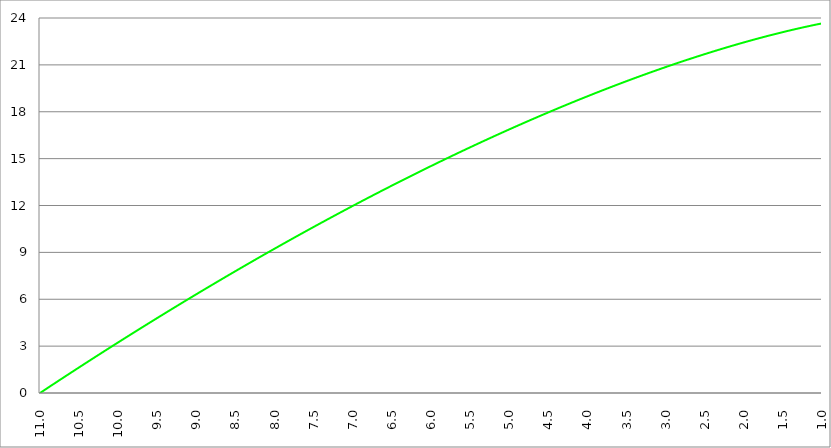
| Category | Series 1 | Series 0 | Series 2 |
|---|---|---|---|
| 11.0 |  | 0 |  |
| 10.995 |  | 0.017 |  |
| 10.99 |  | 0.033 |  |
| 10.985 |  | 0.05 |  |
| 10.98 |  | 0.066 |  |
| 10.975 |  | 0.083 |  |
| 10.97 |  | 0.099 |  |
| 10.96499999999999 |  | 0.116 |  |
| 10.96 |  | 0.133 |  |
| 10.955 |  | 0.149 |  |
| 10.95 |  | 0.166 |  |
| 10.945 |  | 0.182 |  |
| 10.94 |  | 0.199 |  |
| 10.93499999999999 |  | 0.215 |  |
| 10.92999999999999 |  | 0.232 |  |
| 10.92499999999999 |  | 0.248 |  |
| 10.91999999999999 |  | 0.265 |  |
| 10.91499999999999 |  | 0.281 |  |
| 10.90999999999999 |  | 0.298 |  |
| 10.90499999999999 |  | 0.314 |  |
| 10.89999999999998 |  | 0.331 |  |
| 10.89499999999998 |  | 0.347 |  |
| 10.88999999999998 |  | 0.364 |  |
| 10.88499999999998 |  | 0.38 |  |
| 10.87999999999998 |  | 0.397 |  |
| 10.87499999999998 |  | 0.413 |  |
| 10.86999999999998 |  | 0.43 |  |
| 10.86499999999998 |  | 0.446 |  |
| 10.85999999999998 |  | 0.463 |  |
| 10.85499999999998 |  | 0.479 |  |
| 10.84999999999998 |  | 0.496 |  |
| 10.84499999999998 |  | 0.512 |  |
| 10.83999999999997 |  | 0.529 |  |
| 10.83499999999997 |  | 0.545 |  |
| 10.82999999999997 |  | 0.562 |  |
| 10.82499999999997 |  | 0.578 |  |
| 10.81999999999997 |  | 0.595 |  |
| 10.81499999999997 |  | 0.611 |  |
| 10.80999999999997 |  | 0.627 |  |
| 10.80499999999997 |  | 0.644 |  |
| 10.79999999999997 |  | 0.66 |  |
| 10.79499999999997 |  | 0.677 |  |
| 10.78999999999997 |  | 0.693 |  |
| 10.78499999999997 |  | 0.71 |  |
| 10.77999999999997 |  | 0.726 |  |
| 10.77499999999996 |  | 0.742 |  |
| 10.76999999999996 |  | 0.759 |  |
| 10.76499999999996 |  | 0.775 |  |
| 10.75999999999996 |  | 0.792 |  |
| 10.75499999999996 |  | 0.808 |  |
| 10.74999999999996 |  | 0.824 |  |
| 10.74499999999996 |  | 0.841 |  |
| 10.73999999999996 |  | 0.857 |  |
| 10.73499999999996 |  | 0.874 |  |
| 10.72999999999996 |  | 0.89 |  |
| 10.72499999999996 |  | 0.906 |  |
| 10.71999999999996 |  | 0.923 |  |
| 10.71499999999996 |  | 0.939 |  |
| 10.70999999999995 |  | 0.955 |  |
| 10.70499999999995 |  | 0.972 |  |
| 10.69999999999995 |  | 0.988 |  |
| 10.69499999999995 |  | 1.005 |  |
| 10.68999999999995 |  | 1.021 |  |
| 10.68499999999995 |  | 1.037 |  |
| 10.67999999999995 |  | 1.054 |  |
| 10.67499999999995 |  | 1.07 |  |
| 10.66999999999995 |  | 1.086 |  |
| 10.66499999999995 |  | 1.103 |  |
| 10.65999999999995 |  | 1.119 |  |
| 10.65499999999995 |  | 1.135 |  |
| 10.64999999999995 |  | 1.152 |  |
| 10.64499999999994 |  | 1.168 |  |
| 10.63999999999994 |  | 1.184 |  |
| 10.63499999999994 |  | 1.2 |  |
| 10.62999999999994 |  | 1.217 |  |
| 10.62499999999994 |  | 1.233 |  |
| 10.61999999999994 |  | 1.249 |  |
| 10.61499999999994 |  | 1.266 |  |
| 10.60999999999994 |  | 1.282 |  |
| 10.60499999999994 |  | 1.298 |  |
| 10.59999999999994 |  | 1.315 |  |
| 10.59499999999994 |  | 1.331 |  |
| 10.58999999999994 |  | 1.347 |  |
| 10.58499999999994 |  | 1.363 |  |
| 10.57999999999993 |  | 1.38 |  |
| 10.57499999999993 |  | 1.396 |  |
| 10.56999999999993 |  | 1.412 |  |
| 10.56499999999993 |  | 1.428 |  |
| 10.55999999999993 |  | 1.445 |  |
| 10.55499999999993 |  | 1.461 |  |
| 10.54999999999993 |  | 1.477 |  |
| 10.54499999999993 |  | 1.493 |  |
| 10.53999999999993 |  | 1.51 |  |
| 10.53499999999993 |  | 1.526 |  |
| 10.52999999999993 |  | 1.542 |  |
| 10.52499999999993 |  | 1.558 |  |
| 10.51999999999992 |  | 1.574 |  |
| 10.51499999999992 |  | 1.591 |  |
| 10.50999999999992 |  | 1.607 |  |
| 10.50499999999992 |  | 1.623 |  |
| 10.49999999999992 |  | 1.639 |  |
| 10.49499999999992 |  | 1.656 |  |
| 10.48999999999992 |  | 1.672 |  |
| 10.48499999999992 |  | 1.688 |  |
| 10.47999999999992 |  | 1.704 |  |
| 10.47499999999992 |  | 1.72 |  |
| 10.46999999999992 |  | 1.736 |  |
| 10.46499999999992 |  | 1.753 |  |
| 10.45999999999992 |  | 1.769 |  |
| 10.45499999999991 |  | 1.785 |  |
| 10.44999999999991 |  | 1.801 |  |
| 10.44499999999991 |  | 1.817 |  |
| 10.43999999999991 |  | 1.833 |  |
| 10.43499999999991 |  | 1.85 |  |
| 10.42999999999991 |  | 1.866 |  |
| 10.42499999999991 |  | 1.882 |  |
| 10.41999999999991 |  | 1.898 |  |
| 10.41499999999991 |  | 1.914 |  |
| 10.40999999999991 |  | 1.93 |  |
| 10.40499999999991 |  | 1.946 |  |
| 10.39999999999991 |  | 1.963 |  |
| 10.39499999999991 |  | 1.979 |  |
| 10.3899999999999 |  | 1.995 |  |
| 10.3849999999999 |  | 2.011 |  |
| 10.3799999999999 |  | 2.027 |  |
| 10.3749999999999 |  | 2.043 |  |
| 10.3699999999999 |  | 2.059 |  |
| 10.3649999999999 |  | 2.075 |  |
| 10.3599999999999 |  | 2.091 |  |
| 10.3549999999999 |  | 2.108 |  |
| 10.3499999999999 |  | 2.124 |  |
| 10.3449999999999 |  | 2.14 |  |
| 10.3399999999999 |  | 2.156 |  |
| 10.3349999999999 |  | 2.172 |  |
| 10.3299999999999 |  | 2.188 |  |
| 10.32499999999989 |  | 2.204 |  |
| 10.31999999999989 |  | 2.22 |  |
| 10.31499999999989 |  | 2.236 |  |
| 10.3099999999999 |  | 2.252 |  |
| 10.3049999999999 |  | 2.268 |  |
| 10.2999999999999 |  | 2.284 |  |
| 10.29499999999989 |  | 2.3 |  |
| 10.28999999999989 |  | 2.316 |  |
| 10.28499999999989 |  | 2.332 |  |
| 10.27999999999989 |  | 2.348 |  |
| 10.27499999999989 |  | 2.364 |  |
| 10.26999999999989 |  | 2.381 |  |
| 10.26499999999989 |  | 2.397 |  |
| 10.25999999999988 |  | 2.413 |  |
| 10.25499999999988 |  | 2.429 |  |
| 10.24999999999988 |  | 2.445 |  |
| 10.24499999999988 |  | 2.461 |  |
| 10.23999999999988 |  | 2.477 |  |
| 10.23499999999988 |  | 2.493 |  |
| 10.22999999999988 |  | 2.509 |  |
| 10.22499999999988 |  | 2.525 |  |
| 10.21999999999988 |  | 2.541 |  |
| 10.21499999999988 |  | 2.557 |  |
| 10.20999999999988 |  | 2.573 |  |
| 10.20499999999988 |  | 2.588 |  |
| 10.19999999999987 |  | 2.604 |  |
| 10.19499999999987 |  | 2.62 |  |
| 10.18999999999987 |  | 2.636 |  |
| 10.18499999999987 |  | 2.652 |  |
| 10.17999999999987 |  | 2.668 |  |
| 10.17499999999987 |  | 2.684 |  |
| 10.16999999999987 |  | 2.7 |  |
| 10.16499999999987 |  | 2.716 |  |
| 10.15999999999987 |  | 2.732 |  |
| 10.15499999999987 |  | 2.748 |  |
| 10.14999999999987 |  | 2.764 |  |
| 10.14499999999987 |  | 2.78 |  |
| 10.13999999999987 |  | 2.796 |  |
| 10.13499999999986 |  | 2.812 |  |
| 10.12999999999986 |  | 2.828 |  |
| 10.12499999999986 |  | 2.844 |  |
| 10.11999999999986 |  | 2.859 |  |
| 10.11499999999986 |  | 2.875 |  |
| 10.10999999999986 |  | 2.891 |  |
| 10.10499999999986 |  | 2.907 |  |
| 10.09999999999986 |  | 2.923 |  |
| 10.09499999999986 |  | 2.939 |  |
| 10.08999999999986 |  | 2.955 |  |
| 10.08499999999986 |  | 2.971 |  |
| 10.07999999999986 |  | 2.987 |  |
| 10.07499999999986 |  | 3.002 |  |
| 10.06999999999985 |  | 3.018 |  |
| 10.06499999999985 |  | 3.034 |  |
| 10.05999999999985 |  | 3.05 |  |
| 10.05499999999985 |  | 3.066 |  |
| 10.04999999999985 |  | 3.082 |  |
| 10.04499999999985 |  | 3.098 |  |
| 10.03999999999985 |  | 3.113 |  |
| 10.03499999999985 |  | 3.129 |  |
| 10.02999999999985 |  | 3.145 |  |
| 10.02499999999985 |  | 3.161 |  |
| 10.01999999999985 |  | 3.177 |  |
| 10.01499999999985 |  | 3.193 |  |
| 10.00999999999985 |  | 3.208 |  |
| 10.00499999999984 |  | 3.224 |  |
| 9.999999999999844 |  | 3.24 |  |
| 9.994999999999841 |  | 3.256 |  |
| 9.98999999999984 |  | 3.272 |  |
| 9.98499999999984 |  | 3.287 |  |
| 9.97999999999984 |  | 3.303 |  |
| 9.97499999999984 |  | 3.319 |  |
| 9.969999999999837 |  | 3.335 |  |
| 9.964999999999838 |  | 3.351 |  |
| 9.959999999999837 |  | 3.366 |  |
| 9.954999999999837 |  | 3.382 |  |
| 9.949999999999836 |  | 3.398 |  |
| 9.944999999999835 |  | 3.414 |  |
| 9.939999999999834 |  | 3.43 |  |
| 9.934999999999834 |  | 3.445 |  |
| 9.929999999999833 |  | 3.461 |  |
| 9.92499999999983 |  | 3.477 |  |
| 9.91999999999983 |  | 3.493 |  |
| 9.91499999999983 |  | 3.508 |  |
| 9.90999999999983 |  | 3.524 |  |
| 9.904999999999829 |  | 3.54 |  |
| 9.899999999999826 |  | 3.555 |  |
| 9.894999999999827 |  | 3.571 |  |
| 9.889999999999826 |  | 3.587 |  |
| 9.884999999999826 |  | 3.603 |  |
| 9.879999999999823 |  | 3.618 |  |
| 9.874999999999824 |  | 3.634 |  |
| 9.869999999999823 |  | 3.65 |  |
| 9.864999999999823 |  | 3.666 |  |
| 9.85999999999982 |  | 3.681 |  |
| 9.85499999999982 |  | 3.697 |  |
| 9.84999999999982 |  | 3.713 |  |
| 9.84499999999982 |  | 3.728 |  |
| 9.839999999999819 |  | 3.744 |  |
| 9.834999999999818 |  | 3.76 |  |
| 9.829999999999817 |  | 3.775 |  |
| 9.824999999999816 |  | 3.791 |  |
| 9.819999999999816 |  | 3.807 |  |
| 9.814999999999815 |  | 3.822 |  |
| 9.809999999999812 |  | 3.838 |  |
| 9.804999999999813 |  | 3.854 |  |
| 9.799999999999812 |  | 3.869 |  |
| 9.794999999999812 |  | 3.885 |  |
| 9.78999999999981 |  | 3.901 |  |
| 9.78499999999981 |  | 3.916 |  |
| 9.77999999999981 |  | 3.932 |  |
| 9.774999999999809 |  | 3.948 |  |
| 9.769999999999808 |  | 3.963 |  |
| 9.764999999999807 |  | 3.979 |  |
| 9.759999999999806 |  | 3.994 |  |
| 9.754999999999805 |  | 4.01 |  |
| 9.749999999999805 |  | 4.026 |  |
| 9.744999999999804 |  | 4.041 |  |
| 9.739999999999803 |  | 4.057 |  |
| 9.734999999999802 |  | 4.072 |  |
| 9.729999999999801 |  | 4.088 |  |
| 9.7249999999998 |  | 4.104 |  |
| 9.7199999999998 |  | 4.119 |  |
| 9.7149999999998 |  | 4.135 |  |
| 9.709999999999798 |  | 4.15 |  |
| 9.704999999999798 |  | 4.166 |  |
| 9.699999999999797 |  | 4.182 |  |
| 9.694999999999794 |  | 4.197 |  |
| 9.689999999999795 |  | 4.213 |  |
| 9.684999999999794 |  | 4.228 |  |
| 9.679999999999794 |  | 4.244 |  |
| 9.674999999999793 |  | 4.259 |  |
| 9.66999999999979 |  | 4.275 |  |
| 9.66499999999979 |  | 4.291 |  |
| 9.65999999999979 |  | 4.306 |  |
| 9.65499999999979 |  | 4.322 |  |
| 9.649999999999787 |  | 4.337 |  |
| 9.644999999999788 |  | 4.353 |  |
| 9.639999999999787 |  | 4.368 |  |
| 9.634999999999787 |  | 4.384 |  |
| 9.629999999999786 |  | 4.399 |  |
| 9.624999999999785 |  | 4.415 |  |
| 9.619999999999784 |  | 4.43 |  |
| 9.614999999999783 |  | 4.446 |  |
| 9.609999999999783 |  | 4.461 |  |
| 9.60499999999978 |  | 4.477 |  |
| 9.59999999999978 |  | 4.492 |  |
| 9.59499999999978 |  | 4.508 |  |
| 9.58999999999978 |  | 4.523 |  |
| 9.584999999999779 |  | 4.539 |  |
| 9.579999999999778 |  | 4.554 |  |
| 9.574999999999777 |  | 4.57 |  |
| 9.569999999999776 |  | 4.585 |  |
| 9.564999999999776 |  | 4.601 |  |
| 9.559999999999773 |  | 4.616 |  |
| 9.554999999999774 |  | 4.632 |  |
| 9.549999999999773 |  | 4.647 |  |
| 9.544999999999773 |  | 4.662 |  |
| 9.539999999999772 |  | 4.678 |  |
| 9.534999999999771 |  | 4.693 |  |
| 9.52999999999977 |  | 4.709 |  |
| 9.52499999999977 |  | 4.724 |  |
| 9.519999999999769 |  | 4.74 |  |
| 9.514999999999768 |  | 4.755 |  |
| 9.509999999999767 |  | 4.77 |  |
| 9.504999999999766 |  | 4.786 |  |
| 9.499999999999766 |  | 4.801 |  |
| 9.494999999999765 |  | 4.817 |  |
| 9.489999999999762 |  | 4.832 |  |
| 9.484999999999763 |  | 4.847 |  |
| 9.47999999999976 |  | 4.863 |  |
| 9.47499999999976 |  | 4.878 |  |
| 9.46999999999976 |  | 4.894 |  |
| 9.46499999999976 |  | 4.909 |  |
| 9.45999999999976 |  | 4.924 |  |
| 9.454999999999758 |  | 4.94 |  |
| 9.449999999999758 |  | 4.955 |  |
| 9.444999999999757 |  | 4.971 |  |
| 9.439999999999756 |  | 4.986 |  |
| 9.434999999999755 |  | 5.001 |  |
| 9.429999999999755 |  | 5.017 |  |
| 9.424999999999754 |  | 5.032 |  |
| 9.419999999999751 |  | 5.047 |  |
| 9.414999999999752 |  | 5.063 |  |
| 9.40999999999975 |  | 5.078 |  |
| 9.40499999999975 |  | 5.093 |  |
| 9.39999999999975 |  | 5.109 |  |
| 9.39499999999975 |  | 5.124 |  |
| 9.389999999999748 |  | 5.139 |  |
| 9.384999999999748 |  | 5.155 |  |
| 9.379999999999747 |  | 5.17 |  |
| 9.374999999999744 |  | 5.185 |  |
| 9.369999999999745 |  | 5.201 |  |
| 9.364999999999744 |  | 5.216 |  |
| 9.35999999999974 |  | 5.231 |  |
| 9.35499999999974 |  | 5.246 |  |
| 9.34999999999974 |  | 5.262 |  |
| 9.34499999999974 |  | 5.277 |  |
| 9.33999999999974 |  | 5.292 |  |
| 9.33499999999974 |  | 5.308 |  |
| 9.329999999999737 |  | 5.323 |  |
| 9.324999999999738 |  | 5.338 |  |
| 9.319999999999737 |  | 5.353 |  |
| 9.314999999999737 |  | 5.369 |  |
| 9.309999999999736 |  | 5.384 |  |
| 9.304999999999733 |  | 5.399 |  |
| 9.299999999999734 |  | 5.414 |  |
| 9.294999999999733 |  | 5.43 |  |
| 9.289999999999733 |  | 5.445 |  |
| 9.28499999999973 |  | 5.46 |  |
| 9.27999999999973 |  | 5.475 |  |
| 9.27499999999973 |  | 5.491 |  |
| 9.26999999999973 |  | 5.506 |  |
| 9.264999999999729 |  | 5.521 |  |
| 9.259999999999726 |  | 5.536 |  |
| 9.254999999999727 |  | 5.552 |  |
| 9.249999999999726 |  | 5.567 |  |
| 9.244999999999726 |  | 5.582 |  |
| 9.239999999999725 |  | 5.597 |  |
| 9.234999999999724 |  | 5.612 |  |
| 9.229999999999723 |  | 5.628 |  |
| 9.224999999999723 |  | 5.643 |  |
| 9.219999999999722 |  | 5.658 |  |
| 9.214999999999721 |  | 5.673 |  |
| 9.20999999999972 |  | 5.688 |  |
| 9.20499999999972 |  | 5.703 |  |
| 9.199999999999719 |  | 5.719 |  |
| 9.194999999999718 |  | 5.734 |  |
| 9.189999999999717 |  | 5.749 |  |
| 9.184999999999716 |  | 5.764 |  |
| 9.179999999999715 |  | 5.779 |  |
| 9.174999999999715 |  | 5.794 |  |
| 9.169999999999712 |  | 5.81 |  |
| 9.164999999999713 |  | 5.825 |  |
| 9.15999999999971 |  | 5.84 |  |
| 9.15499999999971 |  | 5.855 |  |
| 9.14999999999971 |  | 5.87 |  |
| 9.14499999999971 |  | 5.885 |  |
| 9.13999999999971 |  | 5.9 |  |
| 9.134999999999708 |  | 5.915 |  |
| 9.129999999999708 |  | 5.931 |  |
| 9.124999999999707 |  | 5.946 |  |
| 9.119999999999706 |  | 5.961 |  |
| 9.114999999999705 |  | 5.976 |  |
| 9.109999999999705 |  | 5.991 |  |
| 9.104999999999704 |  | 6.006 |  |
| 9.099999999999701 |  | 6.021 |  |
| 9.094999999999702 |  | 6.036 |  |
| 9.0899999999997 |  | 6.051 |  |
| 9.0849999999997 |  | 6.066 |  |
| 9.0799999999997 |  | 6.081 |  |
| 9.0749999999997 |  | 6.096 |  |
| 9.069999999999698 |  | 6.112 |  |
| 9.064999999999698 |  | 6.127 |  |
| 9.059999999999697 |  | 6.142 |  |
| 9.054999999999694 |  | 6.157 |  |
| 9.049999999999695 |  | 6.172 |  |
| 9.044999999999694 |  | 6.187 |  |
| 9.039999999999694 |  | 6.202 |  |
| 9.034999999999693 |  | 6.217 |  |
| 9.02999999999969 |  | 6.232 |  |
| 9.02499999999969 |  | 6.247 |  |
| 9.01999999999969 |  | 6.262 |  |
| 9.01499999999969 |  | 6.277 |  |
| 9.009999999999687 |  | 6.292 |  |
| 9.004999999999688 |  | 6.307 |  |
| 8.999999999999687 |  | 6.322 |  |
| 8.994999999999687 |  | 6.337 |  |
| 8.989999999999686 |  | 6.352 |  |
| 8.984999999999683 |  | 6.367 |  |
| 8.979999999999684 |  | 6.382 |  |
| 8.974999999999683 |  | 6.397 |  |
| 8.96999999999968 |  | 6.412 |  |
| 8.96499999999968 |  | 6.427 |  |
| 8.95999999999968 |  | 6.442 |  |
| 8.95499999999968 |  | 6.457 |  |
| 8.94999999999968 |  | 6.472 |  |
| 8.944999999999679 |  | 6.487 |  |
| 8.939999999999676 |  | 6.502 |  |
| 8.934999999999677 |  | 6.517 |  |
| 8.929999999999676 |  | 6.532 |  |
| 8.924999999999676 |  | 6.546 |  |
| 8.919999999999675 |  | 6.561 |  |
| 8.914999999999674 |  | 6.576 |  |
| 8.909999999999673 |  | 6.591 |  |
| 8.904999999999673 |  | 6.606 |  |
| 8.89999999999967 |  | 6.621 |  |
| 8.89499999999967 |  | 6.636 |  |
| 8.88999999999967 |  | 6.651 |  |
| 8.88499999999967 |  | 6.666 |  |
| 8.879999999999669 |  | 6.681 |  |
| 8.874999999999668 |  | 6.696 |  |
| 8.869999999999665 |  | 6.711 |  |
| 8.864999999999666 |  | 6.725 |  |
| 8.859999999999665 |  | 6.74 |  |
| 8.854999999999665 |  | 6.755 |  |
| 8.849999999999662 |  | 6.77 |  |
| 8.844999999999663 |  | 6.785 |  |
| 8.83999999999966 |  | 6.8 |  |
| 8.83499999999966 |  | 6.815 |  |
| 8.82999999999966 |  | 6.829 |  |
| 8.82499999999966 |  | 6.844 |  |
| 8.81999999999966 |  | 6.859 |  |
| 8.814999999999658 |  | 6.874 |  |
| 8.809999999999658 |  | 6.889 |  |
| 8.804999999999657 |  | 6.904 |  |
| 8.799999999999656 |  | 6.919 |  |
| 8.794999999999655 |  | 6.933 |  |
| 8.789999999999655 |  | 6.948 |  |
| 8.784999999999654 |  | 6.963 |  |
| 8.779999999999651 |  | 6.978 |  |
| 8.774999999999652 |  | 6.993 |  |
| 8.76999999999965 |  | 7.007 |  |
| 8.76499999999965 |  | 7.022 |  |
| 8.75999999999965 |  | 7.037 |  |
| 8.754999999999647 |  | 7.052 |  |
| 8.749999999999648 |  | 7.067 |  |
| 8.744999999999647 |  | 7.081 |  |
| 8.739999999999647 |  | 7.096 |  |
| 8.734999999999644 |  | 7.111 |  |
| 8.729999999999645 |  | 7.126 |  |
| 8.724999999999644 |  | 7.141 |  |
| 8.719999999999644 |  | 7.155 |  |
| 8.714999999999643 |  | 7.17 |  |
| 8.70999999999964 |  | 7.185 |  |
| 8.70499999999964 |  | 7.2 |  |
| 8.69999999999964 |  | 7.214 |  |
| 8.69499999999964 |  | 7.229 |  |
| 8.689999999999637 |  | 7.244 |  |
| 8.684999999999638 |  | 7.259 |  |
| 8.679999999999637 |  | 7.273 |  |
| 8.674999999999637 |  | 7.288 |  |
| 8.669999999999636 |  | 7.303 |  |
| 8.664999999999633 |  | 7.318 |  |
| 8.659999999999634 |  | 7.332 |  |
| 8.654999999999633 |  | 7.347 |  |
| 8.649999999999633 |  | 7.362 |  |
| 8.644999999999632 |  | 7.376 |  |
| 8.63999999999963 |  | 7.391 |  |
| 8.63499999999963 |  | 7.406 |  |
| 8.62999999999963 |  | 7.42 |  |
| 8.624999999999629 |  | 7.435 |  |
| 8.619999999999626 |  | 7.45 |  |
| 8.614999999999627 |  | 7.464 |  |
| 8.609999999999626 |  | 7.479 |  |
| 8.604999999999626 |  | 7.494 |  |
| 8.599999999999625 |  | 7.508 |  |
| 8.594999999999624 |  | 7.523 |  |
| 8.589999999999623 |  | 7.538 |  |
| 8.584999999999622 |  | 7.552 |  |
| 8.57999999999962 |  | 7.567 |  |
| 8.57499999999962 |  | 7.582 |  |
| 8.56999999999962 |  | 7.596 |  |
| 8.56499999999962 |  | 7.611 |  |
| 8.559999999999619 |  | 7.626 |  |
| 8.554999999999618 |  | 7.64 |  |
| 8.549999999999617 |  | 7.655 |  |
| 8.544999999999616 |  | 7.67 |  |
| 8.539999999999615 |  | 7.684 |  |
| 8.534999999999615 |  | 7.699 |  |
| 8.529999999999612 |  | 7.713 |  |
| 8.524999999999613 |  | 7.728 |  |
| 8.51999999999961 |  | 7.743 |  |
| 8.51499999999961 |  | 7.757 |  |
| 8.50999999999961 |  | 7.772 |  |
| 8.50499999999961 |  | 7.786 |  |
| 8.49999999999961 |  | 7.801 |  |
| 8.494999999999608 |  | 7.815 |  |
| 8.489999999999608 |  | 7.83 |  |
| 8.484999999999607 |  | 7.845 |  |
| 8.479999999999606 |  | 7.859 |  |
| 8.474999999999605 |  | 7.874 |  |
| 8.469999999999605 |  | 7.888 |  |
| 8.464999999999604 |  | 7.903 |  |
| 8.4599999999996 |  | 7.917 |  |
| 8.4549999999996 |  | 7.932 |  |
| 8.4499999999996 |  | 7.946 |  |
| 8.4449999999996 |  | 7.961 |  |
| 8.4399999999996 |  | 7.976 |  |
| 8.4349999999996 |  | 7.99 |  |
| 8.429999999999598 |  | 8.005 |  |
| 8.424999999999597 |  | 8.019 |  |
| 8.419999999999597 |  | 8.034 |  |
| 8.414999999999594 |  | 8.048 |  |
| 8.409999999999595 |  | 8.063 |  |
| 8.404999999999594 |  | 8.077 |  |
| 8.399999999999594 |  | 8.092 |  |
| 8.394999999999593 |  | 8.106 |  |
| 8.38999999999959 |  | 8.121 |  |
| 8.38499999999959 |  | 8.135 |  |
| 8.37999999999959 |  | 8.15 |  |
| 8.37499999999959 |  | 8.164 |  |
| 8.369999999999589 |  | 8.178 |  |
| 8.364999999999588 |  | 8.193 |  |
| 8.359999999999587 |  | 8.207 |  |
| 8.354999999999587 |  | 8.222 |  |
| 8.349999999999586 |  | 8.236 |  |
| 8.344999999999585 |  | 8.251 |  |
| 8.339999999999584 |  | 8.265 |  |
| 8.334999999999583 |  | 8.28 |  |
| 8.329999999999583 |  | 8.294 |  |
| 8.324999999999582 |  | 8.308 |  |
| 8.31999999999958 |  | 8.323 |  |
| 8.31499999999958 |  | 8.337 |  |
| 8.30999999999958 |  | 8.352 |  |
| 8.304999999999579 |  | 8.366 |  |
| 8.299999999999578 |  | 8.381 |  |
| 8.294999999999577 |  | 8.395 |  |
| 8.289999999999576 |  | 8.409 |  |
| 8.284999999999576 |  | 8.424 |  |
| 8.279999999999575 |  | 8.438 |  |
| 8.274999999999574 |  | 8.453 |  |
| 8.269999999999573 |  | 8.467 |  |
| 8.264999999999572 |  | 8.481 |  |
| 8.259999999999572 |  | 8.496 |  |
| 8.254999999999571 |  | 8.51 |  |
| 8.24999999999957 |  | 8.524 |  |
| 8.24499999999957 |  | 8.539 |  |
| 8.239999999999569 |  | 8.553 |  |
| 8.234999999999568 |  | 8.567 |  |
| 8.229999999999567 |  | 8.582 |  |
| 8.224999999999566 |  | 8.596 |  |
| 8.219999999999565 |  | 8.61 |  |
| 8.214999999999565 |  | 8.625 |  |
| 8.209999999999564 |  | 8.639 |  |
| 8.204999999999563 |  | 8.653 |  |
| 8.199999999999562 |  | 8.668 |  |
| 8.194999999999562 |  | 8.682 |  |
| 8.18999999999956 |  | 8.696 |  |
| 8.18499999999956 |  | 8.711 |  |
| 8.17999999999956 |  | 8.725 |  |
| 8.174999999999558 |  | 8.739 |  |
| 8.169999999999558 |  | 8.754 |  |
| 8.164999999999557 |  | 8.768 |  |
| 8.159999999999556 |  | 8.782 |  |
| 8.154999999999555 |  | 8.796 |  |
| 8.149999999999554 |  | 8.811 |  |
| 8.144999999999554 |  | 8.825 |  |
| 8.139999999999553 |  | 8.839 |  |
| 8.134999999999552 |  | 8.854 |  |
| 8.129999999999551 |  | 8.868 |  |
| 8.12499999999955 |  | 8.882 |  |
| 8.11999999999955 |  | 8.896 |  |
| 8.11499999999955 |  | 8.911 |  |
| 8.109999999999548 |  | 8.925 |  |
| 8.104999999999547 |  | 8.939 |  |
| 8.099999999999547 |  | 8.953 |  |
| 8.094999999999544 |  | 8.967 |  |
| 8.089999999999545 |  | 8.982 |  |
| 8.084999999999544 |  | 8.996 |  |
| 8.079999999999544 |  | 9.01 |  |
| 8.074999999999543 |  | 9.024 |  |
| 8.06999999999954 |  | 9.039 |  |
| 8.06499999999954 |  | 9.053 |  |
| 8.05999999999954 |  | 9.067 |  |
| 8.05499999999954 |  | 9.081 |  |
| 8.049999999999539 |  | 9.095 |  |
| 8.044999999999538 |  | 9.11 |  |
| 8.039999999999537 |  | 9.124 |  |
| 8.034999999999537 |  | 9.138 |  |
| 8.029999999999536 |  | 9.152 |  |
| 8.024999999999535 |  | 9.166 |  |
| 8.019999999999534 |  | 9.18 |  |
| 8.014999999999533 |  | 9.195 |  |
| 8.009999999999533 |  | 9.209 |  |
| 8.004999999999532 |  | 9.223 |  |
| 7.999999999999531 |  | 9.237 |  |
| 7.994999999999532 |  | 9.251 |  |
| 7.989999999999532 |  | 9.265 |  |
| 7.984999999999532 |  | 9.279 |  |
| 7.979999999999532 |  | 9.294 |  |
| 7.974999999999532 |  | 9.308 |  |
| 7.969999999999532 |  | 9.322 |  |
| 7.964999999999533 |  | 9.336 |  |
| 7.959999999999532 |  | 9.35 |  |
| 7.954999999999533 |  | 9.364 |  |
| 7.949999999999532 |  | 9.378 |  |
| 7.944999999999533 |  | 9.392 |  |
| 7.939999999999533 |  | 9.406 |  |
| 7.934999999999533 |  | 9.42 |  |
| 7.929999999999533 |  | 9.435 |  |
| 7.924999999999534 |  | 9.449 |  |
| 7.919999999999533 |  | 9.463 |  |
| 7.914999999999534 |  | 9.477 |  |
| 7.909999999999533 |  | 9.491 |  |
| 7.904999999999534 |  | 9.505 |  |
| 7.899999999999534 |  | 9.519 |  |
| 7.894999999999534 |  | 9.533 |  |
| 7.889999999999534 |  | 9.547 |  |
| 7.884999999999534 |  | 9.561 |  |
| 7.879999999999534 |  | 9.575 |  |
| 7.874999999999534 |  | 9.589 |  |
| 7.869999999999534 |  | 9.603 |  |
| 7.864999999999535 |  | 9.617 |  |
| 7.859999999999534 |  | 9.631 |  |
| 7.854999999999535 |  | 9.645 |  |
| 7.849999999999535 |  | 9.659 |  |
| 7.844999999999535 |  | 9.673 |  |
| 7.839999999999535 |  | 9.687 |  |
| 7.834999999999535 |  | 9.701 |  |
| 7.829999999999535 |  | 9.715 |  |
| 7.824999999999536 |  | 9.729 |  |
| 7.819999999999535 |  | 9.743 |  |
| 7.814999999999536 |  | 9.757 |  |
| 7.809999999999535 |  | 9.771 |  |
| 7.804999999999536 |  | 9.785 |  |
| 7.799999999999536 |  | 9.799 |  |
| 7.794999999999536 |  | 9.813 |  |
| 7.789999999999536 |  | 9.827 |  |
| 7.784999999999536 |  | 9.841 |  |
| 7.779999999999536 |  | 9.855 |  |
| 7.774999999999536 |  | 9.869 |  |
| 7.769999999999536 |  | 9.883 |  |
| 7.764999999999537 |  | 9.897 |  |
| 7.759999999999536 |  | 9.911 |  |
| 7.754999999999537 |  | 9.925 |  |
| 7.749999999999537 |  | 9.939 |  |
| 7.744999999999537 |  | 9.952 |  |
| 7.739999999999537 |  | 9.966 |  |
| 7.734999999999537 |  | 9.98 |  |
| 7.729999999999537 |  | 9.994 |  |
| 7.724999999999538 |  | 10.008 |  |
| 7.719999999999537 |  | 10.022 |  |
| 7.714999999999538 |  | 10.036 |  |
| 7.709999999999538 |  | 10.05 |  |
| 7.704999999999538 |  | 10.064 |  |
| 7.699999999999538 |  | 10.077 |  |
| 7.694999999999538 |  | 10.091 |  |
| 7.689999999999538 |  | 10.105 |  |
| 7.684999999999539 |  | 10.119 |  |
| 7.679999999999538 |  | 10.133 |  |
| 7.674999999999539 |  | 10.147 |  |
| 7.669999999999539 |  | 10.161 |  |
| 7.664999999999539 |  | 10.175 |  |
| 7.65999999999954 |  | 10.188 |  |
| 7.654999999999539 |  | 10.202 |  |
| 7.64999999999954 |  | 10.216 |  |
| 7.644999999999539 |  | 10.23 |  |
| 7.63999999999954 |  | 10.244 |  |
| 7.63499999999954 |  | 10.257 |  |
| 7.62999999999954 |  | 10.271 |  |
| 7.62499999999954 |  | 10.285 |  |
| 7.61999999999954 |  | 10.299 |  |
| 7.61499999999954 |  | 10.313 |  |
| 7.60999999999954 |  | 10.327 |  |
| 7.60499999999954 |  | 10.34 |  |
| 7.59999999999954 |  | 10.354 |  |
| 7.594999999999541 |  | 10.368 |  |
| 7.58999999999954 |  | 10.382 |  |
| 7.584999999999541 |  | 10.395 |  |
| 7.57999999999954 |  | 10.409 |  |
| 7.574999999999541 |  | 10.423 |  |
| 7.569999999999541 |  | 10.437 |  |
| 7.564999999999541 |  | 10.45 |  |
| 7.559999999999541 |  | 10.464 |  |
| 7.554999999999541 |  | 10.478 |  |
| 7.549999999999541 |  | 10.492 |  |
| 7.544999999999542 |  | 10.505 |  |
| 7.539999999999541 |  | 10.519 |  |
| 7.534999999999542 |  | 10.533 |  |
| 7.529999999999542 |  | 10.547 |  |
| 7.524999999999542 |  | 10.56 |  |
| 7.519999999999542 |  | 10.574 |  |
| 7.514999999999542 |  | 10.588 |  |
| 7.509999999999542 |  | 10.601 |  |
| 7.504999999999542 |  | 10.615 |  |
| 7.499999999999542 |  | 10.629 |  |
| 7.494999999999543 |  | 10.643 |  |
| 7.489999999999542 |  | 10.656 |  |
| 7.484999999999543 |  | 10.67 |  |
| 7.479999999999542 |  | 10.684 |  |
| 7.474999999999543 |  | 10.697 |  |
| 7.469999999999543 |  | 10.711 |  |
| 7.464999999999543 |  | 10.725 |  |
| 7.459999999999543 |  | 10.738 |  |
| 7.454999999999544 |  | 10.752 |  |
| 7.449999999999543 |  | 10.766 |  |
| 7.444999999999544 |  | 10.779 |  |
| 7.439999999999543 |  | 10.793 |  |
| 7.434999999999544 |  | 10.806 |  |
| 7.429999999999544 |  | 10.82 |  |
| 7.424999999999544 |  | 10.834 |  |
| 7.419999999999544 |  | 10.847 |  |
| 7.414999999999544 |  | 10.861 |  |
| 7.409999999999544 |  | 10.875 |  |
| 7.404999999999544 |  | 10.888 |  |
| 7.399999999999544 |  | 10.902 |  |
| 7.394999999999545 |  | 10.915 |  |
| 7.389999999999544 |  | 10.929 |  |
| 7.384999999999545 |  | 10.943 |  |
| 7.379999999999545 |  | 10.956 |  |
| 7.374999999999545 |  | 10.97 |  |
| 7.369999999999545 |  | 10.983 |  |
| 7.364999999999545 |  | 10.997 |  |
| 7.359999999999545 |  | 11.01 |  |
| 7.354999999999546 |  | 11.024 |  |
| 7.349999999999545 |  | 11.038 |  |
| 7.344999999999546 |  | 11.051 |  |
| 7.339999999999545 |  | 11.065 |  |
| 7.334999999999546 |  | 11.078 |  |
| 7.329999999999546 |  | 11.092 |  |
| 7.324999999999546 |  | 11.105 |  |
| 7.319999999999546 |  | 11.119 |  |
| 7.314999999999546 |  | 11.132 |  |
| 7.309999999999546 |  | 11.146 |  |
| 7.304999999999547 |  | 11.159 |  |
| 7.299999999999546 |  | 11.173 |  |
| 7.294999999999547 |  | 11.186 |  |
| 7.289999999999547 |  | 11.2 |  |
| 7.284999999999547 |  | 11.213 |  |
| 7.279999999999547 |  | 11.227 |  |
| 7.274999999999547 |  | 11.24 |  |
| 7.269999999999547 |  | 11.254 |  |
| 7.264999999999548 |  | 11.267 |  |
| 7.259999999999547 |  | 11.281 |  |
| 7.254999999999548 |  | 11.294 |  |
| 7.249999999999547 |  | 11.308 |  |
| 7.244999999999548 |  | 11.321 |  |
| 7.239999999999548 |  | 11.335 |  |
| 7.234999999999548 |  | 11.348 |  |
| 7.229999999999548 |  | 11.362 |  |
| 7.224999999999548 |  | 11.375 |  |
| 7.219999999999548 |  | 11.388 |  |
| 7.214999999999549 |  | 11.402 |  |
| 7.209999999999548 |  | 11.415 |  |
| 7.204999999999549 |  | 11.429 |  |
| 7.199999999999549 |  | 11.442 |  |
| 7.194999999999549 |  | 11.456 |  |
| 7.18999999999955 |  | 11.469 |  |
| 7.184999999999549 |  | 11.482 |  |
| 7.17999999999955 |  | 11.496 |  |
| 7.17499999999955 |  | 11.509 |  |
| 7.16999999999955 |  | 11.523 |  |
| 7.16499999999955 |  | 11.536 |  |
| 7.15999999999955 |  | 11.549 |  |
| 7.15499999999955 |  | 11.563 |  |
| 7.14999999999955 |  | 11.576 |  |
| 7.14499999999955 |  | 11.589 |  |
| 7.13999999999955 |  | 11.603 |  |
| 7.13499999999955 |  | 11.616 |  |
| 7.12999999999955 |  | 11.63 |  |
| 7.124999999999551 |  | 11.643 |  |
| 7.119999999999551 |  | 11.656 |  |
| 7.114999999999551 |  | 11.67 |  |
| 7.109999999999551 |  | 11.683 |  |
| 7.104999999999551 |  | 11.696 |  |
| 7.099999999999551 |  | 11.71 |  |
| 7.094999999999551 |  | 11.723 |  |
| 7.089999999999551 |  | 11.736 |  |
| 7.084999999999551 |  | 11.75 |  |
| 7.079999999999551 |  | 11.763 |  |
| 7.074999999999552 |  | 11.776 |  |
| 7.069999999999552 |  | 11.789 |  |
| 7.064999999999552 |  | 11.803 |  |
| 7.059999999999552 |  | 11.816 |  |
| 7.054999999999552 |  | 11.829 |  |
| 7.049999999999552 |  | 11.843 |  |
| 7.044999999999552 |  | 11.856 |  |
| 7.039999999999552 |  | 11.869 |  |
| 7.034999999999552 |  | 11.882 |  |
| 7.029999999999553 |  | 11.896 |  |
| 7.024999999999553 |  | 11.909 |  |
| 7.019999999999553 |  | 11.922 |  |
| 7.014999999999553 |  | 11.935 |  |
| 7.009999999999553 |  | 11.949 |  |
| 7.004999999999553 |  | 11.962 |  |
| 6.999999999999553 |  | 11.975 |  |
| 6.994999999999553 |  | 11.988 |  |
| 6.989999999999553 |  | 12.002 |  |
| 6.984999999999554 |  | 12.015 |  |
| 6.979999999999553 |  | 12.028 |  |
| 6.974999999999554 |  | 12.041 |  |
| 6.969999999999554 |  | 12.054 |  |
| 6.964999999999554 |  | 12.068 |  |
| 6.959999999999554 |  | 12.081 |  |
| 6.954999999999554 |  | 12.094 |  |
| 6.949999999999554 |  | 12.107 |  |
| 6.944999999999554 |  | 12.12 |  |
| 6.939999999999554 |  | 12.133 |  |
| 6.934999999999554 |  | 12.147 |  |
| 6.929999999999554 |  | 12.16 |  |
| 6.924999999999555 |  | 12.173 |  |
| 6.919999999999554 |  | 12.186 |  |
| 6.914999999999555 |  | 12.199 |  |
| 6.909999999999555 |  | 12.212 |  |
| 6.904999999999555 |  | 12.226 |  |
| 6.899999999999555 |  | 12.239 |  |
| 6.894999999999555 |  | 12.252 |  |
| 6.889999999999555 |  | 12.265 |  |
| 6.884999999999556 |  | 12.278 |  |
| 6.879999999999555 |  | 12.291 |  |
| 6.874999999999556 |  | 12.304 |  |
| 6.869999999999556 |  | 12.317 |  |
| 6.864999999999556 |  | 12.331 |  |
| 6.859999999999556 |  | 12.344 |  |
| 6.854999999999556 |  | 12.357 |  |
| 6.849999999999556 |  | 12.37 |  |
| 6.844999999999556 |  | 12.383 |  |
| 6.839999999999556 |  | 12.396 |  |
| 6.834999999999557 |  | 12.409 |  |
| 6.829999999999557 |  | 12.422 |  |
| 6.824999999999557 |  | 12.435 |  |
| 6.819999999999557 |  | 12.448 |  |
| 6.814999999999557 |  | 12.461 |  |
| 6.809999999999557 |  | 12.474 |  |
| 6.804999999999557 |  | 12.487 |  |
| 6.799999999999557 |  | 12.5 |  |
| 6.794999999999558 |  | 12.513 |  |
| 6.789999999999557 |  | 12.526 |  |
| 6.784999999999558 |  | 12.54 |  |
| 6.779999999999557 |  | 12.553 |  |
| 6.774999999999558 |  | 12.566 |  |
| 6.769999999999558 |  | 12.579 |  |
| 6.764999999999558 |  | 12.592 |  |
| 6.759999999999558 |  | 12.605 |  |
| 6.754999999999558 |  | 12.618 |  |
| 6.749999999999558 |  | 12.631 |  |
| 6.744999999999559 |  | 12.644 |  |
| 6.739999999999558 |  | 12.657 |  |
| 6.734999999999559 |  | 12.67 |  |
| 6.729999999999559 |  | 12.682 |  |
| 6.724999999999559 |  | 12.695 |  |
| 6.71999999999956 |  | 12.708 |  |
| 6.714999999999559 |  | 12.721 |  |
| 6.70999999999956 |  | 12.734 |  |
| 6.704999999999559 |  | 12.747 |  |
| 6.69999999999956 |  | 12.76 |  |
| 6.69499999999956 |  | 12.773 |  |
| 6.68999999999956 |  | 12.786 |  |
| 6.68499999999956 |  | 12.799 |  |
| 6.67999999999956 |  | 12.812 |  |
| 6.67499999999956 |  | 12.825 |  |
| 6.66999999999956 |  | 12.838 |  |
| 6.66499999999956 |  | 12.851 |  |
| 6.65999999999956 |  | 12.864 |  |
| 6.654999999999561 |  | 12.877 |  |
| 6.64999999999956 |  | 12.889 |  |
| 6.644999999999561 |  | 12.902 |  |
| 6.63999999999956 |  | 12.915 |  |
| 6.634999999999561 |  | 12.928 |  |
| 6.629999999999561 |  | 12.941 |  |
| 6.624999999999561 |  | 12.954 |  |
| 6.619999999999561 |  | 12.967 |  |
| 6.614999999999561 |  | 12.98 |  |
| 6.609999999999561 |  | 12.992 |  |
| 6.604999999999562 |  | 13.005 |  |
| 6.599999999999561 |  | 13.018 |  |
| 6.594999999999562 |  | 13.031 |  |
| 6.589999999999561 |  | 13.044 |  |
| 6.584999999999562 |  | 13.057 |  |
| 6.579999999999562 |  | 13.069 |  |
| 6.574999999999562 |  | 13.082 |  |
| 6.569999999999562 |  | 13.095 |  |
| 6.564999999999563 |  | 13.108 |  |
| 6.559999999999562 |  | 13.121 |  |
| 6.554999999999563 |  | 13.134 |  |
| 6.549999999999562 |  | 13.146 |  |
| 6.544999999999563 |  | 13.159 |  |
| 6.539999999999563 |  | 13.172 |  |
| 6.534999999999563 |  | 13.185 |  |
| 6.529999999999563 |  | 13.197 |  |
| 6.524999999999563 |  | 13.21 |  |
| 6.519999999999563 |  | 13.223 |  |
| 6.514999999999564 |  | 13.236 |  |
| 6.509999999999563 |  | 13.249 |  |
| 6.504999999999564 |  | 13.261 |  |
| 6.499999999999563 |  | 13.274 |  |
| 6.494999999999564 |  | 13.287 |  |
| 6.489999999999564 |  | 13.3 |  |
| 6.484999999999564 |  | 13.312 |  |
| 6.479999999999564 |  | 13.325 |  |
| 6.474999999999564 |  | 13.338 |  |
| 6.469999999999564 |  | 13.35 |  |
| 6.464999999999564 |  | 13.363 |  |
| 6.459999999999564 |  | 13.376 |  |
| 6.454999999999564 |  | 13.389 |  |
| 6.449999999999564 |  | 13.401 |  |
| 6.444999999999565 |  | 13.414 |  |
| 6.439999999999565 |  | 13.427 |  |
| 6.434999999999565 |  | 13.439 |  |
| 6.429999999999565 |  | 13.452 |  |
| 6.424999999999565 |  | 13.465 |  |
| 6.419999999999565 |  | 13.477 |  |
| 6.414999999999565 |  | 13.49 |  |
| 6.409999999999565 |  | 13.503 |  |
| 6.404999999999565 |  | 13.515 |  |
| 6.399999999999565 |  | 13.528 |  |
| 6.394999999999566 |  | 13.541 |  |
| 6.389999999999566 |  | 13.553 |  |
| 6.384999999999566 |  | 13.566 |  |
| 6.379999999999566 |  | 13.579 |  |
| 6.374999999999566 |  | 13.591 |  |
| 6.369999999999566 |  | 13.604 |  |
| 6.364999999999567 |  | 13.616 |  |
| 6.359999999999566 |  | 13.629 |  |
| 6.354999999999567 |  | 13.642 |  |
| 6.349999999999567 |  | 13.654 |  |
| 6.344999999999567 |  | 13.667 |  |
| 6.339999999999567 |  | 13.679 |  |
| 6.334999999999567 |  | 13.692 |  |
| 6.329999999999567 |  | 13.705 |  |
| 6.324999999999568 |  | 13.717 |  |
| 6.319999999999567 |  | 13.73 |  |
| 6.314999999999568 |  | 13.742 |  |
| 6.309999999999567 |  | 13.755 |  |
| 6.304999999999568 |  | 13.767 |  |
| 6.299999999999568 |  | 13.78 |  |
| 6.294999999999568 |  | 13.793 |  |
| 6.289999999999568 |  | 13.805 |  |
| 6.284999999999568 |  | 13.818 |  |
| 6.279999999999568 |  | 13.83 |  |
| 6.274999999999568 |  | 13.843 |  |
| 6.269999999999568 |  | 13.855 |  |
| 6.264999999999569 |  | 13.868 |  |
| 6.259999999999568 |  | 13.88 |  |
| 6.25499999999957 |  | 13.893 |  |
| 6.24999999999957 |  | 13.905 |  |
| 6.24499999999957 |  | 13.918 |  |
| 6.23999999999957 |  | 13.93 |  |
| 6.23499999999957 |  | 13.943 |  |
| 6.22999999999957 |  | 13.955 |  |
| 6.22499999999957 |  | 13.968 |  |
| 6.21999999999957 |  | 13.98 |  |
| 6.21499999999957 |  | 13.993 |  |
| 6.20999999999957 |  | 14.005 |  |
| 6.20499999999957 |  | 14.018 |  |
| 6.19999999999957 |  | 14.03 |  |
| 6.19499999999957 |  | 14.042 |  |
| 6.18999999999957 |  | 14.055 |  |
| 6.184999999999571 |  | 14.067 |  |
| 6.17999999999957 |  | 14.08 |  |
| 6.174999999999571 |  | 14.092 |  |
| 6.169999999999571 |  | 14.105 |  |
| 6.164999999999571 |  | 14.117 |  |
| 6.159999999999571 |  | 14.129 |  |
| 6.154999999999571 |  | 14.142 |  |
| 6.149999999999571 |  | 14.154 |  |
| 6.144999999999571 |  | 14.167 |  |
| 6.139999999999571 |  | 14.179 |  |
| 6.134999999999572 |  | 14.191 |  |
| 6.129999999999572 |  | 14.204 |  |
| 6.124999999999572 |  | 14.216 |  |
| 6.119999999999572 |  | 14.229 |  |
| 6.114999999999572 |  | 14.241 |  |
| 6.109999999999572 |  | 14.253 |  |
| 6.104999999999572 |  | 14.266 |  |
| 6.099999999999572 |  | 14.278 |  |
| 6.094999999999573 |  | 14.29 |  |
| 6.089999999999572 |  | 14.303 |  |
| 6.084999999999573 |  | 14.315 |  |
| 6.079999999999572 |  | 14.327 |  |
| 6.074999999999573 |  | 14.34 |  |
| 6.069999999999573 |  | 14.352 |  |
| 6.064999999999573 |  | 14.364 |  |
| 6.059999999999573 |  | 14.377 |  |
| 6.054999999999573 |  | 14.389 |  |
| 6.049999999999573 |  | 14.401 |  |
| 6.044999999999574 |  | 14.414 |  |
| 6.039999999999573 |  | 14.426 |  |
| 6.034999999999574 |  | 14.438 |  |
| 6.029999999999574 |  | 14.45 |  |
| 6.024999999999574 |  | 14.463 |  |
| 6.019999999999574 |  | 14.475 |  |
| 6.014999999999574 |  | 14.487 |  |
| 6.009999999999574 |  | 14.499 |  |
| 6.004999999999574 |  | 14.512 |  |
| 5.999999999999574 |  | 14.524 |  |
| 5.994999999999574 |  | 14.536 |  |
| 5.989999999999574 |  | 14.548 |  |
| 5.984999999999574 |  | 14.561 |  |
| 5.979999999999574 |  | 14.573 |  |
| 5.974999999999575 |  | 14.585 |  |
| 5.969999999999575 |  | 14.597 |  |
| 5.964999999999575 |  | 14.61 |  |
| 5.959999999999575 |  | 14.622 |  |
| 5.954999999999575 |  | 14.634 |  |
| 5.949999999999575 |  | 14.646 |  |
| 5.944999999999575 |  | 14.658 |  |
| 5.939999999999575 |  | 14.671 |  |
| 5.934999999999575 |  | 14.683 |  |
| 5.929999999999576 |  | 14.695 |  |
| 5.924999999999576 |  | 14.707 |  |
| 5.919999999999576 |  | 14.719 |  |
| 5.914999999999576 |  | 14.731 |  |
| 5.909999999999576 |  | 14.744 |  |
| 5.904999999999576 |  | 14.756 |  |
| 5.899999999999576 |  | 14.768 |  |
| 5.894999999999577 |  | 14.78 |  |
| 5.889999999999576 |  | 14.792 |  |
| 5.884999999999577 |  | 14.804 |  |
| 5.879999999999577 |  | 14.816 |  |
| 5.874999999999577 |  | 14.829 |  |
| 5.869999999999577 |  | 14.841 |  |
| 5.864999999999577 |  | 14.853 |  |
| 5.859999999999577 |  | 14.865 |  |
| 5.854999999999578 |  | 14.877 |  |
| 5.849999999999577 |  | 14.889 |  |
| 5.844999999999578 |  | 14.901 |  |
| 5.839999999999577 |  | 14.913 |  |
| 5.834999999999578 |  | 14.925 |  |
| 5.829999999999578 |  | 14.937 |  |
| 5.824999999999578 |  | 14.949 |  |
| 5.819999999999578 |  | 14.962 |  |
| 5.814999999999578 |  | 14.974 |  |
| 5.809999999999578 |  | 14.986 |  |
| 5.804999999999579 |  | 14.998 |  |
| 5.799999999999578 |  | 15.01 |  |
| 5.794999999999579 |  | 15.022 |  |
| 5.789999999999578 |  | 15.034 |  |
| 5.78499999999958 |  | 15.046 |  |
| 5.77999999999958 |  | 15.058 |  |
| 5.77499999999958 |  | 15.07 |  |
| 5.76999999999958 |  | 15.082 |  |
| 5.764999999999579 |  | 15.094 |  |
| 5.75999999999958 |  | 15.106 |  |
| 5.75499999999958 |  | 15.118 |  |
| 5.74999999999958 |  | 15.13 |  |
| 5.74499999999958 |  | 15.142 |  |
| 5.73999999999958 |  | 15.154 |  |
| 5.73499999999958 |  | 15.166 |  |
| 5.72999999999958 |  | 15.178 |  |
| 5.72499999999958 |  | 15.19 |  |
| 5.71999999999958 |  | 15.202 |  |
| 5.714999999999581 |  | 15.214 |  |
| 5.70999999999958 |  | 15.226 |  |
| 5.704999999999581 |  | 15.238 |  |
| 5.699999999999581 |  | 15.25 |  |
| 5.694999999999581 |  | 15.261 |  |
| 5.689999999999581 |  | 15.273 |  |
| 5.684999999999581 |  | 15.285 |  |
| 5.679999999999581 |  | 15.297 |  |
| 5.674999999999581 |  | 15.309 |  |
| 5.669999999999581 |  | 15.321 |  |
| 5.664999999999582 |  | 15.333 |  |
| 5.659999999999582 |  | 15.345 |  |
| 5.654999999999582 |  | 15.357 |  |
| 5.649999999999582 |  | 15.369 |  |
| 5.644999999999582 |  | 15.381 |  |
| 5.639999999999582 |  | 15.392 |  |
| 5.634999999999582 |  | 15.404 |  |
| 5.629999999999582 |  | 15.416 |  |
| 5.624999999999582 |  | 15.428 |  |
| 5.619999999999583 |  | 15.44 |  |
| 5.614999999999583 |  | 15.452 |  |
| 5.609999999999583 |  | 15.464 |  |
| 5.604999999999583 |  | 15.475 |  |
| 5.599999999999583 |  | 15.487 |  |
| 5.594999999999583 |  | 15.499 |  |
| 5.589999999999583 |  | 15.511 |  |
| 5.584999999999583 |  | 15.523 |  |
| 5.579999999999583 |  | 15.535 |  |
| 5.574999999999584 |  | 15.546 |  |
| 5.569999999999584 |  | 15.558 |  |
| 5.564999999999584 |  | 15.57 |  |
| 5.559999999999584 |  | 15.582 |  |
| 5.554999999999584 |  | 15.594 |  |
| 5.549999999999584 |  | 15.605 |  |
| 5.544999999999584 |  | 15.617 |  |
| 5.539999999999584 |  | 15.629 |  |
| 5.534999999999584 |  | 15.641 |  |
| 5.529999999999584 |  | 15.652 |  |
| 5.524999999999585 |  | 15.664 |  |
| 5.519999999999584 |  | 15.676 |  |
| 5.514999999999585 |  | 15.688 |  |
| 5.509999999999585 |  | 15.699 |  |
| 5.504999999999585 |  | 15.711 |  |
| 5.499999999999585 |  | 15.723 |  |
| 5.494999999999585 |  | 15.735 |  |
| 5.489999999999585 |  | 15.746 |  |
| 5.484999999999585 |  | 15.758 |  |
| 5.479999999999585 |  | 15.77 |  |
| 5.474999999999585 |  | 15.781 |  |
| 5.469999999999585 |  | 15.793 |  |
| 5.464999999999586 |  | 15.805 |  |
| 5.459999999999586 |  | 15.816 |  |
| 5.454999999999586 |  | 15.828 |  |
| 5.449999999999586 |  | 15.84 |  |
| 5.444999999999586 |  | 15.851 |  |
| 5.439999999999586 |  | 15.863 |  |
| 5.434999999999586 |  | 15.875 |  |
| 5.429999999999586 |  | 15.886 |  |
| 5.424999999999587 |  | 15.898 |  |
| 5.419999999999586 |  | 15.91 |  |
| 5.414999999999587 |  | 15.921 |  |
| 5.409999999999587 |  | 15.933 |  |
| 5.404999999999587 |  | 15.945 |  |
| 5.399999999999587 |  | 15.956 |  |
| 5.394999999999587 |  | 15.968 |  |
| 5.389999999999587 |  | 15.979 |  |
| 5.384999999999588 |  | 15.991 |  |
| 5.379999999999587 |  | 16.003 |  |
| 5.374999999999588 |  | 16.014 |  |
| 5.369999999999588 |  | 16.026 |  |
| 5.364999999999588 |  | 16.037 |  |
| 5.359999999999588 |  | 16.049 |  |
| 5.354999999999588 |  | 16.061 |  |
| 5.349999999999588 |  | 16.072 |  |
| 5.344999999999588 |  | 16.084 |  |
| 5.339999999999588 |  | 16.095 |  |
| 5.334999999999589 |  | 16.107 |  |
| 5.329999999999589 |  | 16.118 |  |
| 5.324999999999589 |  | 16.13 |  |
| 5.31999999999959 |  | 16.141 |  |
| 5.314999999999589 |  | 16.153 |  |
| 5.30999999999959 |  | 16.165 |  |
| 5.304999999999589 |  | 16.176 |  |
| 5.29999999999959 |  | 16.188 |  |
| 5.29499999999959 |  | 16.199 |  |
| 5.28999999999959 |  | 16.211 |  |
| 5.28499999999959 |  | 16.222 |  |
| 5.27999999999959 |  | 16.234 |  |
| 5.27499999999959 |  | 16.245 |  |
| 5.26999999999959 |  | 16.257 |  |
| 5.26499999999959 |  | 16.268 |  |
| 5.25999999999959 |  | 16.279 |  |
| 5.25499999999959 |  | 16.291 |  |
| 5.24999999999959 |  | 16.302 |  |
| 5.244999999999591 |  | 16.314 |  |
| 5.23999999999959 |  | 16.325 |  |
| 5.234999999999591 |  | 16.337 |  |
| 5.229999999999591 |  | 16.348 |  |
| 5.224999999999591 |  | 16.36 |  |
| 5.219999999999591 |  | 16.371 |  |
| 5.214999999999591 |  | 16.382 |  |
| 5.209999999999591 |  | 16.394 |  |
| 5.204999999999591 |  | 16.405 |  |
| 5.199999999999592 |  | 16.417 |  |
| 5.194999999999592 |  | 16.428 |  |
| 5.189999999999592 |  | 16.439 |  |
| 5.184999999999592 |  | 16.451 |  |
| 5.179999999999592 |  | 16.462 |  |
| 5.174999999999592 |  | 16.474 |  |
| 5.169999999999592 |  | 16.485 |  |
| 5.164999999999592 |  | 16.496 |  |
| 5.159999999999592 |  | 16.508 |  |
| 5.154999999999593 |  | 16.519 |  |
| 5.149999999999593 |  | 16.53 |  |
| 5.144999999999593 |  | 16.542 |  |
| 5.139999999999593 |  | 16.553 |  |
| 5.134999999999593 |  | 16.564 |  |
| 5.129999999999593 |  | 16.576 |  |
| 5.124999999999593 |  | 16.587 |  |
| 5.119999999999593 |  | 16.598 |  |
| 5.114999999999593 |  | 16.61 |  |
| 5.109999999999594 |  | 16.621 |  |
| 5.104999999999594 |  | 16.632 |  |
| 5.099999999999594 |  | 16.644 |  |
| 5.094999999999594 |  | 16.655 |  |
| 5.089999999999594 |  | 16.666 |  |
| 5.084999999999594 |  | 16.677 |  |
| 5.079999999999594 |  | 16.689 |  |
| 5.074999999999594 |  | 16.7 |  |
| 5.069999999999594 |  | 16.711 |  |
| 5.064999999999594 |  | 16.723 |  |
| 5.059999999999594 |  | 16.734 |  |
| 5.054999999999595 |  | 16.745 |  |
| 5.049999999999594 |  | 16.756 |  |
| 5.044999999999595 |  | 16.768 |  |
| 5.039999999999595 |  | 16.779 |  |
| 5.034999999999595 |  | 16.79 |  |
| 5.029999999999595 |  | 16.801 |  |
| 5.024999999999595 |  | 16.812 |  |
| 5.019999999999595 |  | 16.824 |  |
| 5.014999999999596 |  | 16.835 |  |
| 5.009999999999595 |  | 16.846 |  |
| 5.004999999999596 |  | 16.857 |  |
| 4.999999999999595 |  | 16.868 |  |
| 4.994999999999596 |  | 16.88 |  |
| 4.989999999999596 |  | 16.891 |  |
| 4.984999999999596 |  | 16.902 |  |
| 4.979999999999596 |  | 16.913 |  |
| 4.974999999999596 |  | 16.924 |  |
| 4.969999999999596 |  | 16.935 |  |
| 4.964999999999597 |  | 16.946 |  |
| 4.959999999999596 |  | 16.958 |  |
| 4.954999999999597 |  | 16.969 |  |
| 4.949999999999596 |  | 16.98 |  |
| 4.944999999999597 |  | 16.991 |  |
| 4.939999999999597 |  | 17.002 |  |
| 4.934999999999597 |  | 17.013 |  |
| 4.929999999999597 |  | 17.024 |  |
| 4.924999999999597 |  | 17.035 |  |
| 4.919999999999597 |  | 17.047 |  |
| 4.914999999999598 |  | 17.058 |  |
| 4.909999999999597 |  | 17.069 |  |
| 4.904999999999598 |  | 17.08 |  |
| 4.899999999999598 |  | 17.091 |  |
| 4.894999999999598 |  | 17.102 |  |
| 4.889999999999598 |  | 17.113 |  |
| 4.884999999999598 |  | 17.124 |  |
| 4.879999999999598 |  | 17.135 |  |
| 4.874999999999598 |  | 17.146 |  |
| 4.869999999999599 |  | 17.157 |  |
| 4.864999999999599 |  | 17.168 |  |
| 4.859999999999599 |  | 17.179 |  |
| 4.854999999999599 |  | 17.19 |  |
| 4.8499999999996 |  | 17.201 |  |
| 4.844999999999599 |  | 17.212 |  |
| 4.8399999999996 |  | 17.223 |  |
| 4.834999999999599 |  | 17.234 |  |
| 4.829999999999599 |  | 17.245 |  |
| 4.8249999999996 |  | 17.256 |  |
| 4.8199999999996 |  | 17.267 |  |
| 4.8149999999996 |  | 17.278 |  |
| 4.8099999999996 |  | 17.289 |  |
| 4.8049999999996 |  | 17.3 |  |
| 4.7999999999996 |  | 17.311 |  |
| 4.7949999999996 |  | 17.322 |  |
| 4.7899999999996 |  | 17.333 |  |
| 4.7849999999996 |  | 17.344 |  |
| 4.7799999999996 |  | 17.355 |  |
| 4.7749999999996 |  | 17.366 |  |
| 4.7699999999996 |  | 17.377 |  |
| 4.764999999999601 |  | 17.388 |  |
| 4.7599999999996 |  | 17.399 |  |
| 4.754999999999601 |  | 17.409 |  |
| 4.7499999999996 |  | 17.42 |  |
| 4.744999999999601 |  | 17.431 |  |
| 4.7399999999996 |  | 17.442 |  |
| 4.734999999999601 |  | 17.453 |  |
| 4.729999999999601 |  | 17.464 |  |
| 4.724999999999602 |  | 17.475 |  |
| 4.719999999999601 |  | 17.486 |  |
| 4.714999999999602 |  | 17.496 |  |
| 4.709999999999601 |  | 17.507 |  |
| 4.704999999999602 |  | 17.518 |  |
| 4.699999999999602 |  | 17.529 |  |
| 4.694999999999602 |  | 17.54 |  |
| 4.689999999999602 |  | 17.551 |  |
| 4.684999999999602 |  | 17.562 |  |
| 4.679999999999602 |  | 17.572 |  |
| 4.674999999999603 |  | 17.583 |  |
| 4.669999999999603 |  | 17.594 |  |
| 4.664999999999603 |  | 17.605 |  |
| 4.659999999999603 |  | 17.616 |  |
| 4.654999999999603 |  | 17.626 |  |
| 4.649999999999603 |  | 17.637 |  |
| 4.644999999999603 |  | 17.648 |  |
| 4.639999999999603 |  | 17.659 |  |
| 4.634999999999604 |  | 17.669 |  |
| 4.629999999999604 |  | 17.68 |  |
| 4.624999999999604 |  | 17.691 |  |
| 4.619999999999604 |  | 17.702 |  |
| 4.614999999999604 |  | 17.712 |  |
| 4.609999999999604 |  | 17.723 |  |
| 4.604999999999604 |  | 17.734 |  |
| 4.599999999999604 |  | 17.745 |  |
| 4.594999999999604 |  | 17.755 |  |
| 4.589999999999604 |  | 17.766 |  |
| 4.584999999999604 |  | 17.777 |  |
| 4.579999999999604 |  | 17.787 |  |
| 4.574999999999604 |  | 17.798 |  |
| 4.569999999999605 |  | 17.809 |  |
| 4.564999999999605 |  | 17.82 |  |
| 4.559999999999605 |  | 17.83 |  |
| 4.554999999999605 |  | 17.841 |  |
| 4.549999999999605 |  | 17.852 |  |
| 4.544999999999605 |  | 17.862 |  |
| 4.539999999999605 |  | 17.873 |  |
| 4.534999999999605 |  | 17.884 |  |
| 4.529999999999605 |  | 17.894 |  |
| 4.524999999999606 |  | 17.905 |  |
| 4.519999999999606 |  | 17.915 |  |
| 4.514999999999606 |  | 17.926 |  |
| 4.509999999999606 |  | 17.937 |  |
| 4.504999999999606 |  | 17.947 |  |
| 4.499999999999606 |  | 17.958 |  |
| 4.494999999999606 |  | 17.969 |  |
| 4.489999999999606 |  | 17.979 |  |
| 4.484999999999606 |  | 17.99 |  |
| 4.479999999999606 |  | 18 |  |
| 4.474999999999607 |  | 18.011 |  |
| 4.469999999999607 |  | 18.021 |  |
| 4.464999999999607 |  | 18.032 |  |
| 4.459999999999607 |  | 18.043 |  |
| 4.454999999999607 |  | 18.053 |  |
| 4.449999999999607 |  | 18.064 |  |
| 4.444999999999607 |  | 18.074 |  |
| 4.439999999999607 |  | 18.085 |  |
| 4.434999999999607 |  | 18.095 |  |
| 4.429999999999607 |  | 18.106 |  |
| 4.424999999999608 |  | 18.116 |  |
| 4.419999999999608 |  | 18.127 |  |
| 4.414999999999608 |  | 18.137 |  |
| 4.409999999999608 |  | 18.148 |  |
| 4.404999999999608 |  | 18.158 |  |
| 4.399999999999608 |  | 18.169 |  |
| 4.394999999999609 |  | 18.179 |  |
| 4.389999999999608 |  | 18.19 |  |
| 4.384999999999609 |  | 18.2 |  |
| 4.37999999999961 |  | 18.211 |  |
| 4.37499999999961 |  | 18.221 |  |
| 4.36999999999961 |  | 18.232 |  |
| 4.364999999999609 |  | 18.242 |  |
| 4.35999999999961 |  | 18.253 |  |
| 4.35499999999961 |  | 18.263 |  |
| 4.34999999999961 |  | 18.273 |  |
| 4.34499999999961 |  | 18.284 |  |
| 4.33999999999961 |  | 18.294 |  |
| 4.33499999999961 |  | 18.305 |  |
| 4.32999999999961 |  | 18.315 |  |
| 4.32499999999961 |  | 18.326 |  |
| 4.31999999999961 |  | 18.336 |  |
| 4.31499999999961 |  | 18.346 |  |
| 4.30999999999961 |  | 18.357 |  |
| 4.304999999999611 |  | 18.367 |  |
| 4.29999999999961 |  | 18.377 |  |
| 4.294999999999611 |  | 18.388 |  |
| 4.28999999999961 |  | 18.398 |  |
| 4.284999999999611 |  | 18.409 |  |
| 4.27999999999961 |  | 18.419 |  |
| 4.274999999999611 |  | 18.429 |  |
| 4.269999999999611 |  | 18.44 |  |
| 4.264999999999612 |  | 18.45 |  |
| 4.259999999999611 |  | 18.46 |  |
| 4.254999999999612 |  | 18.471 |  |
| 4.249999999999611 |  | 18.481 |  |
| 4.244999999999612 |  | 18.491 |  |
| 4.239999999999612 |  | 18.501 |  |
| 4.234999999999612 |  | 18.512 |  |
| 4.229999999999612 |  | 18.522 |  |
| 4.224999999999612 |  | 18.532 |  |
| 4.219999999999612 |  | 18.543 |  |
| 4.214999999999613 |  | 18.553 |  |
| 4.209999999999612 |  | 18.563 |  |
| 4.204999999999613 |  | 18.573 |  |
| 4.199999999999613 |  | 18.584 |  |
| 4.194999999999613 |  | 18.594 |  |
| 4.189999999999613 |  | 18.604 |  |
| 4.184999999999613 |  | 18.614 |  |
| 4.179999999999613 |  | 18.625 |  |
| 4.174999999999613 |  | 18.635 |  |
| 4.169999999999614 |  | 18.645 |  |
| 4.164999999999614 |  | 18.655 |  |
| 4.159999999999614 |  | 18.665 |  |
| 4.154999999999614 |  | 18.676 |  |
| 4.149999999999614 |  | 18.686 |  |
| 4.144999999999614 |  | 18.696 |  |
| 4.139999999999614 |  | 18.706 |  |
| 4.134999999999614 |  | 18.716 |  |
| 4.129999999999614 |  | 18.726 |  |
| 4.124999999999615 |  | 18.737 |  |
| 4.119999999999614 |  | 18.747 |  |
| 4.114999999999615 |  | 18.757 |  |
| 4.109999999999614 |  | 18.767 |  |
| 4.104999999999615 |  | 18.777 |  |
| 4.099999999999615 |  | 18.787 |  |
| 4.094999999999615 |  | 18.797 |  |
| 4.089999999999615 |  | 18.808 |  |
| 4.084999999999615 |  | 18.818 |  |
| 4.079999999999615 |  | 18.828 |  |
| 4.074999999999615 |  | 18.838 |  |
| 4.069999999999615 |  | 18.848 |  |
| 4.064999999999616 |  | 18.858 |  |
| 4.059999999999615 |  | 18.868 |  |
| 4.054999999999616 |  | 18.878 |  |
| 4.049999999999616 |  | 18.888 |  |
| 4.044999999999616 |  | 18.898 |  |
| 4.039999999999616 |  | 18.908 |  |
| 4.034999999999616 |  | 18.918 |  |
| 4.029999999999616 |  | 18.928 |  |
| 4.024999999999617 |  | 18.939 |  |
| 4.019999999999616 |  | 18.949 |  |
| 4.014999999999617 |  | 18.959 |  |
| 4.009999999999616 |  | 18.969 |  |
| 4.004999999999617 |  | 18.979 |  |
| 3.999999999999617 |  | 18.989 |  |
| 3.994999999999617 |  | 18.999 |  |
| 3.989999999999617 |  | 19.009 |  |
| 3.984999999999617 |  | 19.019 |  |
| 3.979999999999618 |  | 19.029 |  |
| 3.974999999999618 |  | 19.039 |  |
| 3.969999999999618 |  | 19.048 |  |
| 3.964999999999618 |  | 19.058 |  |
| 3.959999999999618 |  | 19.068 |  |
| 3.954999999999618 |  | 19.078 |  |
| 3.949999999999618 |  | 19.088 |  |
| 3.944999999999618 |  | 19.098 |  |
| 3.939999999999618 |  | 19.108 |  |
| 3.934999999999619 |  | 19.118 |  |
| 3.929999999999619 |  | 19.128 |  |
| 3.924999999999619 |  | 19.138 |  |
| 3.919999999999619 |  | 19.148 |  |
| 3.914999999999619 |  | 19.158 |  |
| 3.909999999999619 |  | 19.168 |  |
| 3.904999999999619 |  | 19.177 |  |
| 3.899999999999619 |  | 19.187 |  |
| 3.894999999999619 |  | 19.197 |  |
| 3.889999999999619 |  | 19.207 |  |
| 3.88499999999962 |  | 19.217 |  |
| 3.87999999999962 |  | 19.227 |  |
| 3.87499999999962 |  | 19.237 |  |
| 3.86999999999962 |  | 19.246 |  |
| 3.86499999999962 |  | 19.256 |  |
| 3.85999999999962 |  | 19.266 |  |
| 3.85499999999962 |  | 19.276 |  |
| 3.84999999999962 |  | 19.286 |  |
| 3.84499999999962 |  | 19.296 |  |
| 3.839999999999621 |  | 19.305 |  |
| 3.834999999999621 |  | 19.315 |  |
| 3.829999999999621 |  | 19.325 |  |
| 3.824999999999621 |  | 19.335 |  |
| 3.819999999999621 |  | 19.345 |  |
| 3.814999999999621 |  | 19.354 |  |
| 3.809999999999621 |  | 19.364 |  |
| 3.804999999999621 |  | 19.374 |  |
| 3.799999999999621 |  | 19.384 |  |
| 3.794999999999621 |  | 19.393 |  |
| 3.789999999999622 |  | 19.403 |  |
| 3.784999999999622 |  | 19.413 |  |
| 3.779999999999622 |  | 19.422 |  |
| 3.774999999999622 |  | 19.432 |  |
| 3.769999999999622 |  | 19.442 |  |
| 3.764999999999622 |  | 19.452 |  |
| 3.759999999999622 |  | 19.461 |  |
| 3.754999999999622 |  | 19.471 |  |
| 3.749999999999622 |  | 19.481 |  |
| 3.744999999999623 |  | 19.49 |  |
| 3.739999999999623 |  | 19.5 |  |
| 3.734999999999623 |  | 19.51 |  |
| 3.729999999999623 |  | 19.519 |  |
| 3.724999999999623 |  | 19.529 |  |
| 3.719999999999623 |  | 19.539 |  |
| 3.714999999999623 |  | 19.548 |  |
| 3.709999999999623 |  | 19.558 |  |
| 3.704999999999623 |  | 19.568 |  |
| 3.699999999999623 |  | 19.577 |  |
| 3.694999999999624 |  | 19.587 |  |
| 3.689999999999624 |  | 19.596 |  |
| 3.684999999999624 |  | 19.606 |  |
| 3.679999999999624 |  | 19.616 |  |
| 3.674999999999624 |  | 19.625 |  |
| 3.669999999999624 |  | 19.635 |  |
| 3.664999999999624 |  | 19.644 |  |
| 3.659999999999624 |  | 19.654 |  |
| 3.654999999999624 |  | 19.663 |  |
| 3.649999999999625 |  | 19.673 |  |
| 3.644999999999625 |  | 19.683 |  |
| 3.639999999999625 |  | 19.692 |  |
| 3.634999999999625 |  | 19.702 |  |
| 3.629999999999625 |  | 19.711 |  |
| 3.624999999999625 |  | 19.721 |  |
| 3.619999999999625 |  | 19.73 |  |
| 3.614999999999625 |  | 19.74 |  |
| 3.609999999999625 |  | 19.749 |  |
| 3.604999999999626 |  | 19.759 |  |
| 3.599999999999626 |  | 19.768 |  |
| 3.594999999999626 |  | 19.778 |  |
| 3.589999999999626 |  | 19.787 |  |
| 3.584999999999626 |  | 19.797 |  |
| 3.579999999999626 |  | 19.806 |  |
| 3.574999999999626 |  | 19.816 |  |
| 3.569999999999626 |  | 19.825 |  |
| 3.564999999999626 |  | 19.834 |  |
| 3.559999999999627 |  | 19.844 |  |
| 3.554999999999627 |  | 19.853 |  |
| 3.549999999999627 |  | 19.863 |  |
| 3.544999999999627 |  | 19.872 |  |
| 3.539999999999627 |  | 19.882 |  |
| 3.534999999999627 |  | 19.891 |  |
| 3.529999999999627 |  | 19.9 |  |
| 3.524999999999627 |  | 19.91 |  |
| 3.519999999999627 |  | 19.919 |  |
| 3.514999999999628 |  | 19.929 |  |
| 3.509999999999628 |  | 19.938 |  |
| 3.504999999999628 |  | 19.947 |  |
| 3.499999999999628 |  | 19.957 |  |
| 3.494999999999628 |  | 19.966 |  |
| 3.489999999999628 |  | 19.975 |  |
| 3.484999999999628 |  | 19.985 |  |
| 3.479999999999628 |  | 19.994 |  |
| 3.474999999999628 |  | 20.003 |  |
| 3.469999999999628 |  | 20.013 |  |
| 3.464999999999629 |  | 20.022 |  |
| 3.459999999999629 |  | 20.031 |  |
| 3.454999999999629 |  | 20.041 |  |
| 3.449999999999629 |  | 20.05 |  |
| 3.444999999999629 |  | 20.059 |  |
| 3.439999999999629 |  | 20.068 |  |
| 3.434999999999629 |  | 20.078 |  |
| 3.429999999999629 |  | 20.087 |  |
| 3.424999999999629 |  | 20.096 |  |
| 3.41999999999963 |  | 20.105 |  |
| 3.41499999999963 |  | 20.115 |  |
| 3.40999999999963 |  | 20.124 |  |
| 3.40499999999963 |  | 20.133 |  |
| 3.39999999999963 |  | 20.142 |  |
| 3.39499999999963 |  | 20.152 |  |
| 3.38999999999963 |  | 20.161 |  |
| 3.38499999999963 |  | 20.17 |  |
| 3.37999999999963 |  | 20.179 |  |
| 3.37499999999963 |  | 20.188 |  |
| 3.369999999999631 |  | 20.198 |  |
| 3.364999999999631 |  | 20.207 |  |
| 3.359999999999631 |  | 20.216 |  |
| 3.354999999999631 |  | 20.225 |  |
| 3.349999999999631 |  | 20.234 |  |
| 3.344999999999631 |  | 20.243 |  |
| 3.339999999999631 |  | 20.253 |  |
| 3.334999999999631 |  | 20.262 |  |
| 3.329999999999631 |  | 20.271 |  |
| 3.324999999999632 |  | 20.28 |  |
| 3.319999999999632 |  | 20.289 |  |
| 3.314999999999632 |  | 20.298 |  |
| 3.309999999999632 |  | 20.307 |  |
| 3.304999999999632 |  | 20.316 |  |
| 3.299999999999632 |  | 20.325 |  |
| 3.294999999999632 |  | 20.334 |  |
| 3.289999999999632 |  | 20.344 |  |
| 3.284999999999632 |  | 20.353 |  |
| 3.279999999999633 |  | 20.362 |  |
| 3.274999999999633 |  | 20.371 |  |
| 3.269999999999633 |  | 20.38 |  |
| 3.264999999999633 |  | 20.389 |  |
| 3.259999999999633 |  | 20.398 |  |
| 3.254999999999633 |  | 20.407 |  |
| 3.249999999999633 |  | 20.416 |  |
| 3.244999999999633 |  | 20.425 |  |
| 3.239999999999633 |  | 20.434 |  |
| 3.234999999999633 |  | 20.443 |  |
| 3.229999999999634 |  | 20.452 |  |
| 3.224999999999634 |  | 20.461 |  |
| 3.219999999999634 |  | 20.47 |  |
| 3.214999999999634 |  | 20.479 |  |
| 3.209999999999634 |  | 20.488 |  |
| 3.204999999999634 |  | 20.497 |  |
| 3.199999999999634 |  | 20.506 |  |
| 3.194999999999634 |  | 20.515 |  |
| 3.189999999999634 |  | 20.524 |  |
| 3.184999999999635 |  | 20.532 |  |
| 3.179999999999635 |  | 20.541 |  |
| 3.174999999999635 |  | 20.55 |  |
| 3.169999999999635 |  | 20.559 |  |
| 3.164999999999635 |  | 20.568 |  |
| 3.159999999999635 |  | 20.577 |  |
| 3.154999999999635 |  | 20.586 |  |
| 3.149999999999635 |  | 20.595 |  |
| 3.144999999999635 |  | 20.604 |  |
| 3.139999999999636 |  | 20.613 |  |
| 3.134999999999636 |  | 20.621 |  |
| 3.129999999999636 |  | 20.63 |  |
| 3.124999999999636 |  | 20.639 |  |
| 3.119999999999636 |  | 20.648 |  |
| 3.114999999999636 |  | 20.657 |  |
| 3.109999999999636 |  | 20.666 |  |
| 3.104999999999636 |  | 20.674 |  |
| 3.099999999999636 |  | 20.683 |  |
| 3.094999999999636 |  | 20.692 |  |
| 3.089999999999637 |  | 20.701 |  |
| 3.084999999999637 |  | 20.71 |  |
| 3.079999999999637 |  | 20.718 |  |
| 3.074999999999637 |  | 20.727 |  |
| 3.069999999999637 |  | 20.736 |  |
| 3.064999999999637 |  | 20.745 |  |
| 3.059999999999637 |  | 20.753 |  |
| 3.054999999999637 |  | 20.762 |  |
| 3.049999999999637 |  | 20.771 |  |
| 3.044999999999638 |  | 20.78 |  |
| 3.039999999999638 |  | 20.788 |  |
| 3.034999999999638 |  | 20.797 |  |
| 3.029999999999638 |  | 20.806 |  |
| 3.024999999999638 |  | 20.814 |  |
| 3.019999999999638 |  | 20.823 |  |
| 3.014999999999638 |  | 20.832 |  |
| 3.009999999999638 |  | 20.84 |  |
| 3.004999999999638 |  | 20.849 |  |
| 2.999999999999638 |  | 20.858 |  |
| 2.994999999999639 |  | 20.866 |  |
| 2.989999999999639 |  | 20.875 |  |
| 2.984999999999639 |  | 20.884 |  |
| 2.979999999999639 |  | 20.892 |  |
| 2.974999999999639 |  | 20.901 |  |
| 2.969999999999639 |  | 20.91 |  |
| 2.964999999999639 |  | 20.918 |  |
| 2.959999999999639 |  | 20.927 |  |
| 2.954999999999639 |  | 20.935 |  |
| 2.94999999999964 |  | 20.944 |  |
| 2.94499999999964 |  | 20.953 |  |
| 2.93999999999964 |  | 20.961 |  |
| 2.93499999999964 |  | 20.97 |  |
| 2.92999999999964 |  | 20.978 |  |
| 2.92499999999964 |  | 20.987 |  |
| 2.91999999999964 |  | 20.995 |  |
| 2.91499999999964 |  | 21.004 |  |
| 2.90999999999964 |  | 21.013 |  |
| 2.904999999999641 |  | 21.021 |  |
| 2.899999999999641 |  | 21.03 |  |
| 2.894999999999641 |  | 21.038 |  |
| 2.889999999999641 |  | 21.047 |  |
| 2.884999999999641 |  | 21.055 |  |
| 2.879999999999641 |  | 21.064 |  |
| 2.874999999999641 |  | 21.072 |  |
| 2.869999999999641 |  | 21.081 |  |
| 2.864999999999641 |  | 21.089 |  |
| 2.859999999999641 |  | 21.097 |  |
| 2.854999999999642 |  | 21.106 |  |
| 2.849999999999642 |  | 21.114 |  |
| 2.844999999999642 |  | 21.123 |  |
| 2.839999999999642 |  | 21.131 |  |
| 2.834999999999642 |  | 21.14 |  |
| 2.829999999999642 |  | 21.148 |  |
| 2.824999999999642 |  | 21.156 |  |
| 2.819999999999642 |  | 21.165 |  |
| 2.814999999999642 |  | 21.173 |  |
| 2.809999999999643 |  | 21.182 |  |
| 2.804999999999643 |  | 21.19 |  |
| 2.799999999999643 |  | 21.198 |  |
| 2.794999999999643 |  | 21.207 |  |
| 2.789999999999643 |  | 21.215 |  |
| 2.784999999999643 |  | 21.223 |  |
| 2.779999999999643 |  | 21.232 |  |
| 2.774999999999643 |  | 21.24 |  |
| 2.769999999999643 |  | 21.248 |  |
| 2.764999999999643 |  | 21.257 |  |
| 2.759999999999644 |  | 21.265 |  |
| 2.754999999999644 |  | 21.273 |  |
| 2.749999999999644 |  | 21.282 |  |
| 2.744999999999644 |  | 21.29 |  |
| 2.739999999999644 |  | 21.298 |  |
| 2.734999999999644 |  | 21.307 |  |
| 2.729999999999644 |  | 21.315 |  |
| 2.724999999999644 |  | 21.323 |  |
| 2.719999999999644 |  | 21.331 |  |
| 2.714999999999645 |  | 21.34 |  |
| 2.709999999999645 |  | 21.348 |  |
| 2.704999999999645 |  | 21.356 |  |
| 2.699999999999645 |  | 21.364 |  |
| 2.694999999999645 |  | 21.372 |  |
| 2.689999999999645 |  | 21.381 |  |
| 2.684999999999645 |  | 21.389 |  |
| 2.679999999999645 |  | 21.397 |  |
| 2.674999999999645 |  | 21.405 |  |
| 2.669999999999645 |  | 21.413 |  |
| 2.664999999999646 |  | 21.422 |  |
| 2.659999999999646 |  | 21.43 |  |
| 2.654999999999646 |  | 21.438 |  |
| 2.649999999999646 |  | 21.446 |  |
| 2.644999999999646 |  | 21.454 |  |
| 2.639999999999646 |  | 21.462 |  |
| 2.634999999999646 |  | 21.47 |  |
| 2.629999999999646 |  | 21.478 |  |
| 2.624999999999646 |  | 21.487 |  |
| 2.619999999999647 |  | 21.495 |  |
| 2.614999999999647 |  | 21.503 |  |
| 2.609999999999647 |  | 21.511 |  |
| 2.604999999999647 |  | 21.519 |  |
| 2.599999999999647 |  | 21.527 |  |
| 2.594999999999647 |  | 21.535 |  |
| 2.589999999999647 |  | 21.543 |  |
| 2.584999999999647 |  | 21.551 |  |
| 2.579999999999647 |  | 21.559 |  |
| 2.574999999999648 |  | 21.567 |  |
| 2.569999999999648 |  | 21.575 |  |
| 2.564999999999648 |  | 21.583 |  |
| 2.559999999999648 |  | 21.591 |  |
| 2.554999999999648 |  | 21.599 |  |
| 2.549999999999648 |  | 21.607 |  |
| 2.544999999999648 |  | 21.615 |  |
| 2.539999999999648 |  | 21.623 |  |
| 2.534999999999648 |  | 21.631 |  |
| 2.529999999999649 |  | 21.639 |  |
| 2.524999999999649 |  | 21.647 |  |
| 2.519999999999649 |  | 21.655 |  |
| 2.514999999999649 |  | 21.663 |  |
| 2.509999999999649 |  | 21.671 |  |
| 2.504999999999649 |  | 21.679 |  |
| 2.499999999999649 |  | 21.687 |  |
| 2.494999999999649 |  | 21.695 |  |
| 2.489999999999649 |  | 21.702 |  |
| 2.484999999999649 |  | 21.71 |  |
| 2.47999999999965 |  | 21.718 |  |
| 2.47499999999965 |  | 21.726 |  |
| 2.46999999999965 |  | 21.734 |  |
| 2.46499999999965 |  | 21.742 |  |
| 2.45999999999965 |  | 21.75 |  |
| 2.45499999999965 |  | 21.758 |  |
| 2.44999999999965 |  | 21.765 |  |
| 2.44499999999965 |  | 21.773 |  |
| 2.43999999999965 |  | 21.781 |  |
| 2.434999999999651 |  | 21.789 |  |
| 2.429999999999651 |  | 21.797 |  |
| 2.424999999999651 |  | 21.804 |  |
| 2.419999999999651 |  | 21.812 |  |
| 2.414999999999651 |  | 21.82 |  |
| 2.409999999999651 |  | 21.828 |  |
| 2.404999999999651 |  | 21.835 |  |
| 2.399999999999651 |  | 21.843 |  |
| 2.394999999999651 |  | 21.851 |  |
| 2.389999999999651 |  | 21.859 |  |
| 2.384999999999652 |  | 21.866 |  |
| 2.379999999999652 |  | 21.874 |  |
| 2.374999999999652 |  | 21.882 |  |
| 2.369999999999652 |  | 21.89 |  |
| 2.364999999999652 |  | 21.897 |  |
| 2.359999999999652 |  | 21.905 |  |
| 2.354999999999652 |  | 21.913 |  |
| 2.349999999999652 |  | 21.92 |  |
| 2.344999999999652 |  | 21.928 |  |
| 2.339999999999653 |  | 21.936 |  |
| 2.334999999999653 |  | 21.943 |  |
| 2.329999999999653 |  | 21.951 |  |
| 2.324999999999653 |  | 21.958 |  |
| 2.319999999999653 |  | 21.966 |  |
| 2.314999999999653 |  | 21.974 |  |
| 2.309999999999653 |  | 21.981 |  |
| 2.304999999999653 |  | 21.989 |  |
| 2.299999999999653 |  | 21.996 |  |
| 2.294999999999654 |  | 22.004 |  |
| 2.289999999999654 |  | 22.012 |  |
| 2.284999999999654 |  | 22.019 |  |
| 2.279999999999654 |  | 22.027 |  |
| 2.274999999999654 |  | 22.034 |  |
| 2.269999999999654 |  | 22.042 |  |
| 2.264999999999654 |  | 22.049 |  |
| 2.259999999999654 |  | 22.057 |  |
| 2.254999999999654 |  | 22.064 |  |
| 2.249999999999654 |  | 22.072 |  |
| 2.244999999999655 |  | 22.079 |  |
| 2.239999999999655 |  | 22.087 |  |
| 2.234999999999655 |  | 22.094 |  |
| 2.229999999999655 |  | 22.102 |  |
| 2.224999999999655 |  | 22.109 |  |
| 2.219999999999655 |  | 22.117 |  |
| 2.214999999999655 |  | 22.124 |  |
| 2.209999999999655 |  | 22.132 |  |
| 2.204999999999655 |  | 22.139 |  |
| 2.199999999999656 |  | 22.146 |  |
| 2.194999999999656 |  | 22.154 |  |
| 2.189999999999656 |  | 22.161 |  |
| 2.184999999999656 |  | 22.169 |  |
| 2.179999999999656 |  | 22.176 |  |
| 2.174999999999656 |  | 22.183 |  |
| 2.169999999999656 |  | 22.191 |  |
| 2.164999999999656 |  | 22.198 |  |
| 2.159999999999656 |  | 22.206 |  |
| 2.154999999999657 |  | 22.213 |  |
| 2.149999999999657 |  | 22.22 |  |
| 2.144999999999657 |  | 22.228 |  |
| 2.139999999999657 |  | 22.235 |  |
| 2.134999999999657 |  | 22.242 |  |
| 2.129999999999657 |  | 22.249 |  |
| 2.124999999999657 |  | 22.257 |  |
| 2.119999999999657 |  | 22.264 |  |
| 2.114999999999657 |  | 22.271 |  |
| 2.109999999999657 |  | 22.279 |  |
| 2.104999999999658 |  | 22.286 |  |
| 2.099999999999658 |  | 22.293 |  |
| 2.094999999999658 |  | 22.3 |  |
| 2.089999999999658 |  | 22.308 |  |
| 2.084999999999658 |  | 22.315 |  |
| 2.079999999999658 |  | 22.322 |  |
| 2.074999999999658 |  | 22.329 |  |
| 2.069999999999658 |  | 22.336 |  |
| 2.064999999999658 |  | 22.344 |  |
| 2.059999999999659 |  | 22.351 |  |
| 2.054999999999659 |  | 22.358 |  |
| 2.049999999999659 |  | 22.365 |  |
| 2.044999999999659 |  | 22.372 |  |
| 2.039999999999659 |  | 22.379 |  |
| 2.034999999999659 |  | 22.387 |  |
| 2.029999999999659 |  | 22.394 |  |
| 2.024999999999659 |  | 22.401 |  |
| 2.019999999999659 |  | 22.408 |  |
| 2.01499999999966 |  | 22.415 |  |
| 2.00999999999966 |  | 22.422 |  |
| 2.00499999999966 |  | 22.429 |  |
| 1.99999999999966 |  | 22.436 |  |
| 1.99499999999966 |  | 22.443 |  |
| 1.98999999999966 |  | 22.45 |  |
| 1.98499999999966 |  | 22.457 |  |
| 1.97999999999966 |  | 22.465 |  |
| 1.97499999999966 |  | 22.472 |  |
| 1.96999999999966 |  | 22.479 |  |
| 1.964999999999661 |  | 22.486 |  |
| 1.959999999999661 |  | 22.493 |  |
| 1.954999999999661 |  | 22.5 |  |
| 1.949999999999661 |  | 22.507 |  |
| 1.944999999999661 |  | 22.514 |  |
| 1.939999999999661 |  | 22.521 |  |
| 1.934999999999661 |  | 22.527 |  |
| 1.929999999999661 |  | 22.534 |  |
| 1.924999999999661 |  | 22.541 |  |
| 1.919999999999662 |  | 22.548 |  |
| 1.914999999999662 |  | 22.555 |  |
| 1.909999999999662 |  | 22.562 |  |
| 1.904999999999662 |  | 22.569 |  |
| 1.899999999999662 |  | 22.576 |  |
| 1.894999999999662 |  | 22.583 |  |
| 1.889999999999662 |  | 22.59 |  |
| 1.884999999999662 |  | 22.597 |  |
| 1.879999999999662 |  | 22.603 |  |
| 1.874999999999662 |  | 22.61 |  |
| 1.869999999999663 |  | 22.617 |  |
| 1.864999999999663 |  | 22.624 |  |
| 1.859999999999663 |  | 22.631 |  |
| 1.854999999999663 |  | 22.638 |  |
| 1.849999999999663 |  | 22.644 |  |
| 1.844999999999663 |  | 22.651 |  |
| 1.839999999999663 |  | 22.658 |  |
| 1.834999999999663 |  | 22.665 |  |
| 1.829999999999663 |  | 22.672 |  |
| 1.824999999999664 |  | 22.678 |  |
| 1.819999999999664 |  | 22.685 |  |
| 1.814999999999664 |  | 22.692 |  |
| 1.809999999999664 |  | 22.699 |  |
| 1.804999999999664 |  | 22.705 |  |
| 1.799999999999664 |  | 22.712 |  |
| 1.794999999999664 |  | 22.719 |  |
| 1.789999999999664 |  | 22.725 |  |
| 1.784999999999664 |  | 22.732 |  |
| 1.779999999999664 |  | 22.739 |  |
| 1.774999999999665 |  | 22.745 |  |
| 1.769999999999665 |  | 22.752 |  |
| 1.764999999999665 |  | 22.759 |  |
| 1.759999999999665 |  | 22.765 |  |
| 1.754999999999665 |  | 22.772 |  |
| 1.749999999999665 |  | 22.779 |  |
| 1.744999999999665 |  | 22.785 |  |
| 1.739999999999665 |  | 22.792 |  |
| 1.734999999999665 |  | 22.798 |  |
| 1.729999999999666 |  | 22.805 |  |
| 1.724999999999666 |  | 22.812 |  |
| 1.719999999999666 |  | 22.818 |  |
| 1.714999999999666 |  | 22.825 |  |
| 1.709999999999666 |  | 22.831 |  |
| 1.704999999999666 |  | 22.838 |  |
| 1.699999999999666 |  | 22.844 |  |
| 1.694999999999666 |  | 22.851 |  |
| 1.689999999999666 |  | 22.857 |  |
| 1.684999999999666 |  | 22.864 |  |
| 1.679999999999667 |  | 22.87 |  |
| 1.674999999999667 |  | 22.877 |  |
| 1.669999999999667 |  | 22.883 |  |
| 1.664999999999667 |  | 22.89 |  |
| 1.659999999999667 |  | 22.896 |  |
| 1.654999999999667 |  | 22.903 |  |
| 1.649999999999667 |  | 22.909 |  |
| 1.644999999999667 |  | 22.915 |  |
| 1.639999999999667 |  | 22.922 |  |
| 1.634999999999668 |  | 22.928 |  |
| 1.629999999999668 |  | 22.935 |  |
| 1.624999999999668 |  | 22.941 |  |
| 1.619999999999668 |  | 22.947 |  |
| 1.614999999999668 |  | 22.954 |  |
| 1.609999999999668 |  | 22.96 |  |
| 1.604999999999668 |  | 22.966 |  |
| 1.599999999999668 |  | 22.973 |  |
| 1.594999999999668 |  | 22.979 |  |
| 1.589999999999669 |  | 22.985 |  |
| 1.584999999999669 |  | 22.992 |  |
| 1.579999999999669 |  | 22.998 |  |
| 1.574999999999669 |  | 23.004 |  |
| 1.569999999999669 |  | 23.01 |  |
| 1.564999999999669 |  | 23.017 |  |
| 1.559999999999669 |  | 23.023 |  |
| 1.554999999999669 |  | 23.029 |  |
| 1.549999999999669 |  | 23.035 |  |
| 1.54499999999967 |  | 23.042 |  |
| 1.53999999999967 |  | 23.048 |  |
| 1.53499999999967 |  | 23.054 |  |
| 1.52999999999967 |  | 23.06 |  |
| 1.52499999999967 |  | 23.066 |  |
| 1.51999999999967 |  | 23.073 |  |
| 1.51499999999967 |  | 23.079 |  |
| 1.50999999999967 |  | 23.085 |  |
| 1.50499999999967 |  | 23.091 |  |
| 1.49999999999967 |  | 23.097 |  |
| 1.494999999999671 |  | 23.103 |  |
| 1.489999999999671 |  | 23.109 |  |
| 1.484999999999671 |  | 23.115 |  |
| 1.479999999999671 |  | 23.122 |  |
| 1.474999999999671 |  | 23.128 |  |
| 1.469999999999671 |  | 23.134 |  |
| 1.464999999999671 |  | 23.14 |  |
| 1.459999999999671 |  | 23.146 |  |
| 1.454999999999671 |  | 23.152 |  |
| 1.449999999999672 |  | 23.158 |  |
| 1.444999999999672 |  | 23.164 |  |
| 1.439999999999672 |  | 23.17 |  |
| 1.434999999999672 |  | 23.176 |  |
| 1.429999999999672 |  | 23.182 |  |
| 1.424999999999672 |  | 23.188 |  |
| 1.419999999999672 |  | 23.194 |  |
| 1.414999999999672 |  | 23.2 |  |
| 1.409999999999672 |  | 23.206 |  |
| 1.404999999999672 |  | 23.212 |  |
| 1.399999999999673 |  | 23.218 |  |
| 1.394999999999673 |  | 23.223 |  |
| 1.389999999999673 |  | 23.229 |  |
| 1.384999999999673 |  | 23.235 |  |
| 1.379999999999673 |  | 23.241 |  |
| 1.374999999999673 |  | 23.247 |  |
| 1.369999999999673 |  | 23.253 |  |
| 1.364999999999673 |  | 23.259 |  |
| 1.359999999999673 |  | 23.265 |  |
| 1.354999999999674 |  | 23.27 |  |
| 1.349999999999674 |  | 23.276 |  |
| 1.344999999999674 |  | 23.282 |  |
| 1.339999999999674 |  | 23.288 |  |
| 1.334999999999674 |  | 23.294 |  |
| 1.329999999999674 |  | 23.299 |  |
| 1.324999999999674 |  | 23.305 |  |
| 1.319999999999674 |  | 23.311 |  |
| 1.314999999999674 |  | 23.317 |  |
| 1.309999999999674 |  | 23.322 |  |
| 1.304999999999675 |  | 23.328 |  |
| 1.299999999999675 |  | 23.334 |  |
| 1.294999999999675 |  | 23.339 |  |
| 1.289999999999675 |  | 23.345 |  |
| 1.284999999999675 |  | 23.351 |  |
| 1.279999999999675 |  | 23.356 |  |
| 1.274999999999675 |  | 23.362 |  |
| 1.269999999999675 |  | 23.368 |  |
| 1.264999999999675 |  | 23.373 |  |
| 1.259999999999676 |  | 23.379 |  |
| 1.254999999999676 |  | 23.385 |  |
| 1.249999999999676 |  | 23.39 |  |
| 1.244999999999676 |  | 23.396 |  |
| 1.239999999999676 |  | 23.401 |  |
| 1.234999999999676 |  | 23.407 |  |
| 1.229999999999676 |  | 23.412 |  |
| 1.224999999999676 |  | 23.418 |  |
| 1.219999999999676 |  | 23.424 |  |
| 1.214999999999677 |  | 23.429 |  |
| 1.209999999999677 |  | 23.435 |  |
| 1.204999999999677 |  | 23.44 |  |
| 1.199999999999677 |  | 23.446 |  |
| 1.194999999999677 |  | 23.451 |  |
| 1.189999999999677 |  | 23.456 |  |
| 1.184999999999677 |  | 23.462 |  |
| 1.179999999999677 |  | 23.467 |  |
| 1.174999999999677 |  | 23.473 |  |
| 1.169999999999677 |  | 23.478 |  |
| 1.164999999999678 |  | 23.484 |  |
| 1.159999999999678 |  | 23.489 |  |
| 1.154999999999678 |  | 23.494 |  |
| 1.149999999999678 |  | 23.5 |  |
| 1.144999999999678 |  | 23.505 |  |
| 1.139999999999678 |  | 23.51 |  |
| 1.134999999999678 |  | 23.516 |  |
| 1.129999999999678 |  | 23.521 |  |
| 1.124999999999678 |  | 23.526 |  |
| 1.119999999999679 |  | 23.532 |  |
| 1.114999999999679 |  | 23.537 |  |
| 1.109999999999679 |  | 23.542 |  |
| 1.104999999999679 |  | 23.548 |  |
| 1.099999999999679 |  | 23.553 |  |
| 1.094999999999679 |  | 23.558 |  |
| 1.089999999999679 |  | 23.563 |  |
| 1.084999999999679 |  | 23.568 |  |
| 1.079999999999679 |  | 23.574 |  |
| 1.07499999999968 |  | 23.579 |  |
| 1.06999999999968 |  | 23.584 |  |
| 1.06499999999968 |  | 23.589 |  |
| 1.05999999999968 |  | 23.594 |  |
| 1.05499999999968 |  | 23.599 |  |
| 1.04999999999968 |  | 23.605 |  |
| 1.04499999999968 |  | 23.61 |  |
| 1.03999999999968 |  | 23.615 |  |
| 1.03499999999968 |  | 23.62 |  |
| 1.02999999999968 |  | 23.625 |  |
| 1.024999999999681 |  | 23.63 |  |
| 1.019999999999681 |  | 23.635 |  |
| 1.014999999999681 |  | 23.64 |  |
| 1.009999999999681 |  | 23.645 |  |
| 1.004999999999681 |  | 23.65 |  |
| 0.999999999999681 |  | 23.655 |  |